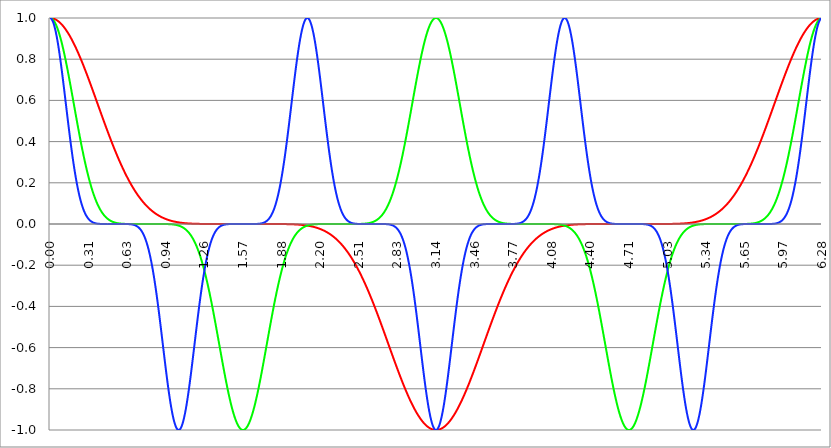
| Category | Series 1 | Series 0 | Series 2 |
|---|---|---|---|
| 0.0 | 1 | 1 | 1 |
| 0.00314159265358979 | 1 | 1 | 1 |
| 0.00628318530717958 | 1 | 0.999 | 0.999 |
| 0.00942477796076938 | 1 | 0.999 | 0.997 |
| 0.0125663706143592 | 0.999 | 0.998 | 0.995 |
| 0.015707963267949 | 0.999 | 0.997 | 0.992 |
| 0.0188495559215388 | 0.999 | 0.995 | 0.989 |
| 0.0219911485751285 | 0.998 | 0.993 | 0.985 |
| 0.0251327412287183 | 0.998 | 0.991 | 0.98 |
| 0.0282743338823081 | 0.997 | 0.989 | 0.975 |
| 0.0314159265358979 | 0.997 | 0.986 | 0.969 |
| 0.0345575191894877 | 0.996 | 0.983 | 0.963 |
| 0.0376991118430775 | 0.995 | 0.98 | 0.956 |
| 0.0408407044966673 | 0.994 | 0.977 | 0.949 |
| 0.0439822971502571 | 0.993 | 0.973 | 0.941 |
| 0.0471238898038469 | 0.992 | 0.969 | 0.932 |
| 0.0502654824574367 | 0.991 | 0.965 | 0.923 |
| 0.0534070751110265 | 0.99 | 0.961 | 0.914 |
| 0.0565486677646163 | 0.989 | 0.956 | 0.904 |
| 0.059690260418206 | 0.988 | 0.951 | 0.893 |
| 0.0628318530717958 | 0.986 | 0.946 | 0.882 |
| 0.0659734457253856 | 0.985 | 0.941 | 0.871 |
| 0.0691150383789754 | 0.983 | 0.935 | 0.859 |
| 0.0722566310325652 | 0.982 | 0.929 | 0.847 |
| 0.075398223686155 | 0.98 | 0.923 | 0.835 |
| 0.0785398163397448 | 0.979 | 0.917 | 0.822 |
| 0.0816814089933346 | 0.977 | 0.91 | 0.809 |
| 0.0848230016469244 | 0.975 | 0.904 | 0.795 |
| 0.0879645943005142 | 0.973 | 0.897 | 0.781 |
| 0.091106186954104 | 0.971 | 0.89 | 0.767 |
| 0.0942477796076937 | 0.969 | 0.882 | 0.753 |
| 0.0973893722612835 | 0.967 | 0.875 | 0.739 |
| 0.100530964914873 | 0.965 | 0.867 | 0.724 |
| 0.103672557568463 | 0.963 | 0.859 | 0.709 |
| 0.106814150222053 | 0.961 | 0.851 | 0.694 |
| 0.109955742875643 | 0.958 | 0.843 | 0.678 |
| 0.113097335529233 | 0.956 | 0.835 | 0.663 |
| 0.116238928182822 | 0.954 | 0.826 | 0.648 |
| 0.119380520836412 | 0.951 | 0.818 | 0.632 |
| 0.122522113490002 | 0.949 | 0.809 | 0.616 |
| 0.125663706143592 | 0.946 | 0.8 | 0.601 |
| 0.128805298797181 | 0.943 | 0.791 | 0.585 |
| 0.131946891450771 | 0.941 | 0.781 | 0.569 |
| 0.135088484104361 | 0.938 | 0.772 | 0.554 |
| 0.138230076757951 | 0.935 | 0.763 | 0.538 |
| 0.141371669411541 | 0.932 | 0.753 | 0.522 |
| 0.14451326206513 | 0.929 | 0.743 | 0.507 |
| 0.14765485471872 | 0.926 | 0.734 | 0.491 |
| 0.15079644737231 | 0.923 | 0.724 | 0.476 |
| 0.1539380400259 | 0.92 | 0.714 | 0.461 |
| 0.15707963267949 | 0.917 | 0.704 | 0.446 |
| 0.160221225333079 | 0.914 | 0.694 | 0.431 |
| 0.163362817986669 | 0.91 | 0.684 | 0.416 |
| 0.166504410640259 | 0.907 | 0.673 | 0.402 |
| 0.169646003293849 | 0.904 | 0.663 | 0.387 |
| 0.172787595947439 | 0.9 | 0.653 | 0.373 |
| 0.175929188601028 | 0.897 | 0.642 | 0.359 |
| 0.179070781254618 | 0.893 | 0.632 | 0.345 |
| 0.182212373908208 | 0.89 | 0.622 | 0.332 |
| 0.185353966561798 | 0.886 | 0.611 | 0.319 |
| 0.188495559215388 | 0.882 | 0.601 | 0.306 |
| 0.191637151868977 | 0.879 | 0.59 | 0.293 |
| 0.194778744522567 | 0.875 | 0.58 | 0.281 |
| 0.197920337176157 | 0.871 | 0.569 | 0.269 |
| 0.201061929829747 | 0.867 | 0.559 | 0.257 |
| 0.204203522483336 | 0.863 | 0.548 | 0.245 |
| 0.207345115136926 | 0.859 | 0.538 | 0.234 |
| 0.210486707790516 | 0.855 | 0.528 | 0.223 |
| 0.213628300444106 | 0.851 | 0.517 | 0.213 |
| 0.216769893097696 | 0.847 | 0.507 | 0.202 |
| 0.219911485751285 | 0.843 | 0.497 | 0.192 |
| 0.223053078404875 | 0.839 | 0.486 | 0.183 |
| 0.226194671058465 | 0.835 | 0.476 | 0.173 |
| 0.229336263712055 | 0.831 | 0.466 | 0.164 |
| 0.232477856365645 | 0.826 | 0.456 | 0.155 |
| 0.235619449019234 | 0.822 | 0.446 | 0.147 |
| 0.238761041672824 | 0.818 | 0.436 | 0.139 |
| 0.241902634326414 | 0.813 | 0.426 | 0.131 |
| 0.245044226980004 | 0.809 | 0.416 | 0.124 |
| 0.248185819633594 | 0.804 | 0.406 | 0.116 |
| 0.251327412287183 | 0.8 | 0.397 | 0.109 |
| 0.254469004940773 | 0.795 | 0.387 | 0.103 |
| 0.257610597594363 | 0.791 | 0.378 | 0.096 |
| 0.260752190247953 | 0.786 | 0.368 | 0.09 |
| 0.263893782901543 | 0.781 | 0.359 | 0.085 |
| 0.267035375555132 | 0.777 | 0.35 | 0.079 |
| 0.270176968208722 | 0.772 | 0.341 | 0.074 |
| 0.273318560862312 | 0.767 | 0.332 | 0.069 |
| 0.276460153515902 | 0.763 | 0.323 | 0.064 |
| 0.279601746169492 | 0.758 | 0.314 | 0.06 |
| 0.282743338823082 | 0.753 | 0.306 | 0.055 |
| 0.285884931476671 | 0.748 | 0.297 | 0.051 |
| 0.289026524130261 | 0.743 | 0.289 | 0.047 |
| 0.292168116783851 | 0.739 | 0.281 | 0.044 |
| 0.295309709437441 | 0.734 | 0.273 | 0.041 |
| 0.298451302091031 | 0.729 | 0.265 | 0.037 |
| 0.30159289474462 | 0.724 | 0.257 | 0.034 |
| 0.30473448739821 | 0.719 | 0.249 | 0.032 |
| 0.3078760800518 | 0.714 | 0.242 | 0.029 |
| 0.31101767270539 | 0.709 | 0.234 | 0.027 |
| 0.31415926535898 | 0.704 | 0.227 | 0.024 |
| 0.31730085801257 | 0.699 | 0.22 | 0.022 |
| 0.320442450666159 | 0.694 | 0.213 | 0.02 |
| 0.323584043319749 | 0.689 | 0.206 | 0.018 |
| 0.326725635973339 | 0.684 | 0.199 | 0.017 |
| 0.329867228626929 | 0.678 | 0.192 | 0.015 |
| 0.333008821280519 | 0.673 | 0.186 | 0.014 |
| 0.336150413934108 | 0.668 | 0.179 | 0.012 |
| 0.339292006587698 | 0.663 | 0.173 | 0.011 |
| 0.342433599241288 | 0.658 | 0.167 | 0.01 |
| 0.345575191894878 | 0.653 | 0.161 | 0.009 |
| 0.348716784548468 | 0.648 | 0.155 | 0.008 |
| 0.351858377202058 | 0.642 | 0.15 | 0.007 |
| 0.354999969855647 | 0.637 | 0.144 | 0.006 |
| 0.358141562509237 | 0.632 | 0.139 | 0.006 |
| 0.361283155162827 | 0.627 | 0.134 | 0.005 |
| 0.364424747816417 | 0.622 | 0.129 | 0.004 |
| 0.367566340470007 | 0.616 | 0.124 | 0.004 |
| 0.370707933123597 | 0.611 | 0.119 | 0.003 |
| 0.373849525777186 | 0.606 | 0.114 | 0.003 |
| 0.376991118430776 | 0.601 | 0.109 | 0.003 |
| 0.380132711084366 | 0.595 | 0.105 | 0.002 |
| 0.383274303737956 | 0.59 | 0.101 | 0.002 |
| 0.386415896391546 | 0.585 | 0.096 | 0.002 |
| 0.389557489045135 | 0.58 | 0.092 | 0.001 |
| 0.392699081698725 | 0.575 | 0.088 | 0.001 |
| 0.395840674352315 | 0.569 | 0.085 | 0.001 |
| 0.398982267005905 | 0.564 | 0.081 | 0.001 |
| 0.402123859659495 | 0.559 | 0.077 | 0.001 |
| 0.405265452313085 | 0.554 | 0.074 | 0.001 |
| 0.408407044966674 | 0.548 | 0.07 | 0.001 |
| 0.411548637620264 | 0.543 | 0.067 | 0 |
| 0.414690230273854 | 0.538 | 0.064 | 0 |
| 0.417831822927444 | 0.533 | 0.061 | 0 |
| 0.420973415581034 | 0.528 | 0.058 | 0 |
| 0.424115008234623 | 0.522 | 0.055 | 0 |
| 0.427256600888213 | 0.517 | 0.053 | 0 |
| 0.430398193541803 | 0.512 | 0.05 | 0 |
| 0.433539786195393 | 0.507 | 0.047 | 0 |
| 0.436681378848983 | 0.502 | 0.045 | 0 |
| 0.439822971502573 | 0.497 | 0.043 | 0 |
| 0.442964564156162 | 0.491 | 0.041 | 0 |
| 0.446106156809752 | 0.486 | 0.038 | 0 |
| 0.449247749463342 | 0.481 | 0.036 | 0 |
| 0.452389342116932 | 0.476 | 0.034 | 0 |
| 0.455530934770522 | 0.471 | 0.032 | 0 |
| 0.458672527424111 | 0.466 | 0.031 | 0 |
| 0.461814120077701 | 0.461 | 0.029 | 0 |
| 0.464955712731291 | 0.456 | 0.027 | 0 |
| 0.468097305384881 | 0.451 | 0.026 | 0 |
| 0.471238898038471 | 0.446 | 0.024 | 0 |
| 0.474380490692061 | 0.441 | 0.023 | 0 |
| 0.47752208334565 | 0.436 | 0.021 | 0 |
| 0.48066367599924 | 0.431 | 0.02 | 0 |
| 0.48380526865283 | 0.426 | 0.019 | 0 |
| 0.48694686130642 | 0.421 | 0.018 | 0 |
| 0.49008845396001 | 0.416 | 0.017 | 0 |
| 0.493230046613599 | 0.411 | 0.016 | 0 |
| 0.496371639267189 | 0.406 | 0.015 | 0 |
| 0.499513231920779 | 0.402 | 0.014 | 0 |
| 0.502654824574369 | 0.397 | 0.013 | 0 |
| 0.505796417227959 | 0.392 | 0.012 | 0 |
| 0.508938009881549 | 0.387 | 0.011 | 0 |
| 0.512079602535138 | 0.383 | 0.01 | 0 |
| 0.515221195188728 | 0.378 | 0.01 | 0 |
| 0.518362787842318 | 0.373 | 0.009 | 0 |
| 0.521504380495908 | 0.368 | 0.008 | 0 |
| 0.524645973149498 | 0.364 | 0.008 | 0 |
| 0.527787565803087 | 0.359 | 0.007 | 0 |
| 0.530929158456677 | 0.355 | 0.007 | 0 |
| 0.534070751110267 | 0.35 | 0.006 | 0 |
| 0.537212343763857 | 0.345 | 0.006 | 0 |
| 0.540353936417447 | 0.341 | 0.005 | 0 |
| 0.543495529071037 | 0.336 | 0.005 | 0 |
| 0.546637121724626 | 0.332 | 0.004 | 0 |
| 0.549778714378216 | 0.328 | 0.004 | 0 |
| 0.552920307031806 | 0.323 | 0.004 | 0 |
| 0.556061899685396 | 0.319 | 0.003 | 0 |
| 0.559203492338986 | 0.314 | 0.003 | 0 |
| 0.562345084992576 | 0.31 | 0.003 | 0 |
| 0.565486677646165 | 0.306 | 0.003 | 0 |
| 0.568628270299755 | 0.302 | 0.002 | 0 |
| 0.571769862953345 | 0.297 | 0.002 | 0 |
| 0.574911455606935 | 0.293 | 0.002 | 0 |
| 0.578053048260525 | 0.289 | 0.002 | 0 |
| 0.581194640914114 | 0.285 | 0.002 | 0 |
| 0.584336233567704 | 0.281 | 0.001 | 0 |
| 0.587477826221294 | 0.277 | 0.001 | 0 |
| 0.590619418874884 | 0.273 | 0.001 | 0 |
| 0.593761011528474 | 0.269 | 0.001 | 0 |
| 0.596902604182064 | 0.265 | 0.001 | 0 |
| 0.600044196835653 | 0.261 | 0.001 | 0 |
| 0.603185789489243 | 0.257 | 0.001 | 0 |
| 0.606327382142833 | 0.253 | 0.001 | 0 |
| 0.609468974796423 | 0.249 | 0.001 | 0 |
| 0.612610567450013 | 0.245 | 0.001 | 0 |
| 0.615752160103602 | 0.242 | 0 | 0 |
| 0.618893752757192 | 0.238 | 0 | 0 |
| 0.622035345410782 | 0.234 | 0 | 0 |
| 0.625176938064372 | 0.23 | 0 | 0 |
| 0.628318530717962 | 0.227 | 0 | 0 |
| 0.631460123371551 | 0.223 | 0 | 0 |
| 0.634601716025141 | 0.22 | 0 | 0 |
| 0.637743308678731 | 0.216 | 0 | 0 |
| 0.640884901332321 | 0.213 | 0 | -0.001 |
| 0.644026493985911 | 0.209 | 0 | -0.001 |
| 0.647168086639501 | 0.206 | 0 | -0.001 |
| 0.65030967929309 | 0.202 | 0 | -0.001 |
| 0.65345127194668 | 0.199 | 0 | -0.001 |
| 0.65659286460027 | 0.196 | 0 | -0.001 |
| 0.65973445725386 | 0.192 | 0 | -0.002 |
| 0.66287604990745 | 0.189 | 0 | -0.002 |
| 0.666017642561039 | 0.186 | 0 | -0.002 |
| 0.669159235214629 | 0.183 | 0 | -0.002 |
| 0.672300827868219 | 0.179 | 0 | -0.003 |
| 0.675442420521809 | 0.176 | 0 | -0.003 |
| 0.678584013175399 | 0.173 | 0 | -0.004 |
| 0.681725605828989 | 0.17 | 0 | -0.004 |
| 0.684867198482578 | 0.167 | 0 | -0.005 |
| 0.688008791136168 | 0.164 | 0 | -0.005 |
| 0.691150383789758 | 0.161 | 0 | -0.006 |
| 0.694291976443348 | 0.158 | 0 | -0.007 |
| 0.697433569096938 | 0.155 | 0 | -0.008 |
| 0.700575161750528 | 0.153 | 0 | -0.009 |
| 0.703716754404117 | 0.15 | 0 | -0.01 |
| 0.706858347057707 | 0.147 | 0 | -0.011 |
| 0.709999939711297 | 0.144 | 0 | -0.012 |
| 0.713141532364887 | 0.142 | 0 | -0.013 |
| 0.716283125018477 | 0.139 | 0 | -0.015 |
| 0.719424717672066 | 0.136 | 0 | -0.016 |
| 0.722566310325656 | 0.134 | 0 | -0.018 |
| 0.725707902979246 | 0.131 | 0 | -0.02 |
| 0.728849495632836 | 0.129 | 0 | -0.021 |
| 0.731991088286426 | 0.126 | 0 | -0.024 |
| 0.735132680940016 | 0.124 | 0 | -0.026 |
| 0.738274273593605 | 0.121 | 0 | -0.028 |
| 0.741415866247195 | 0.119 | 0 | -0.031 |
| 0.744557458900785 | 0.116 | 0 | -0.033 |
| 0.747699051554375 | 0.114 | 0 | -0.036 |
| 0.750840644207965 | 0.112 | 0 | -0.039 |
| 0.753982236861554 | 0.109 | 0 | -0.043 |
| 0.757123829515144 | 0.107 | 0 | -0.046 |
| 0.760265422168734 | 0.105 | 0 | -0.05 |
| 0.763407014822324 | 0.103 | 0 | -0.054 |
| 0.766548607475914 | 0.101 | 0 | -0.058 |
| 0.769690200129504 | 0.098 | 0 | -0.063 |
| 0.772831792783093 | 0.096 | 0 | -0.067 |
| 0.775973385436683 | 0.094 | 0 | -0.072 |
| 0.779114978090273 | 0.092 | 0 | -0.077 |
| 0.782256570743863 | 0.09 | 0 | -0.083 |
| 0.785398163397453 | 0.088 | 0 | -0.088 |
| 0.788539756051042 | 0.086 | 0 | -0.094 |
| 0.791681348704632 | 0.085 | 0 | -0.101 |
| 0.794822941358222 | 0.083 | 0 | -0.107 |
| 0.797964534011812 | 0.081 | 0 | -0.114 |
| 0.801106126665402 | 0.079 | 0 | -0.121 |
| 0.804247719318992 | 0.077 | 0 | -0.129 |
| 0.807389311972581 | 0.076 | 0 | -0.136 |
| 0.810530904626171 | 0.074 | 0 | -0.144 |
| 0.813672497279761 | 0.072 | 0 | -0.153 |
| 0.816814089933351 | 0.07 | 0 | -0.161 |
| 0.819955682586941 | 0.069 | 0 | -0.17 |
| 0.823097275240531 | 0.067 | 0 | -0.179 |
| 0.82623886789412 | 0.066 | 0 | -0.189 |
| 0.82938046054771 | 0.064 | 0 | -0.199 |
| 0.8325220532013 | 0.063 | 0 | -0.209 |
| 0.83566364585489 | 0.061 | 0 | -0.22 |
| 0.83880523850848 | 0.06 | 0 | -0.23 |
| 0.841946831162069 | 0.058 | 0 | -0.242 |
| 0.845088423815659 | 0.057 | 0 | -0.253 |
| 0.848230016469249 | 0.055 | 0 | -0.265 |
| 0.851371609122839 | 0.054 | 0 | -0.277 |
| 0.854513201776429 | 0.053 | 0 | -0.289 |
| 0.857654794430019 | 0.051 | 0 | -0.302 |
| 0.860796387083608 | 0.05 | 0 | -0.314 |
| 0.863937979737198 | 0.049 | 0 | -0.328 |
| 0.867079572390788 | 0.047 | 0 | -0.341 |
| 0.870221165044378 | 0.046 | 0 | -0.355 |
| 0.873362757697968 | 0.045 | 0 | -0.368 |
| 0.876504350351557 | 0.044 | 0 | -0.383 |
| 0.879645943005147 | 0.043 | 0 | -0.397 |
| 0.882787535658737 | 0.042 | 0 | -0.411 |
| 0.885929128312327 | 0.041 | 0 | -0.426 |
| 0.889070720965917 | 0.039 | 0 | -0.441 |
| 0.892212313619507 | 0.038 | 0 | -0.456 |
| 0.895353906273096 | 0.037 | 0 | -0.471 |
| 0.898495498926686 | 0.036 | 0 | -0.486 |
| 0.901637091580276 | 0.035 | 0 | -0.502 |
| 0.904778684233866 | 0.034 | 0 | -0.517 |
| 0.907920276887456 | 0.033 | 0 | -0.533 |
| 0.911061869541045 | 0.032 | 0 | -0.548 |
| 0.914203462194635 | 0.032 | 0 | -0.564 |
| 0.917345054848225 | 0.031 | 0 | -0.58 |
| 0.920486647501815 | 0.03 | 0 | -0.595 |
| 0.923628240155405 | 0.029 | 0 | -0.611 |
| 0.926769832808995 | 0.028 | 0 | -0.627 |
| 0.929911425462584 | 0.027 | 0 | -0.642 |
| 0.933053018116174 | 0.027 | 0 | -0.658 |
| 0.936194610769764 | 0.026 | 0 | -0.673 |
| 0.939336203423354 | 0.025 | 0 | -0.689 |
| 0.942477796076944 | 0.024 | 0 | -0.704 |
| 0.945619388730533 | 0.024 | 0 | -0.719 |
| 0.948760981384123 | 0.023 | 0 | -0.734 |
| 0.951902574037713 | 0.022 | 0 | -0.748 |
| 0.955044166691303 | 0.021 | 0 | -0.763 |
| 0.958185759344893 | 0.021 | -0.001 | -0.777 |
| 0.961327351998483 | 0.02 | -0.001 | -0.791 |
| 0.964468944652072 | 0.02 | -0.001 | -0.804 |
| 0.967610537305662 | 0.019 | -0.001 | -0.818 |
| 0.970752129959252 | 0.018 | -0.001 | -0.831 |
| 0.973893722612842 | 0.018 | -0.001 | -0.843 |
| 0.977035315266432 | 0.017 | -0.001 | -0.855 |
| 0.980176907920022 | 0.017 | -0.001 | -0.867 |
| 0.983318500573611 | 0.016 | -0.001 | -0.879 |
| 0.986460093227201 | 0.016 | -0.001 | -0.89 |
| 0.989601685880791 | 0.015 | -0.002 | -0.9 |
| 0.992743278534381 | 0.015 | -0.002 | -0.91 |
| 0.995884871187971 | 0.014 | -0.002 | -0.92 |
| 0.99902646384156 | 0.014 | -0.002 | -0.929 |
| 1.00216805649515 | 0.013 | -0.002 | -0.938 |
| 1.00530964914874 | 0.013 | -0.003 | -0.946 |
| 1.00845124180233 | 0.012 | -0.003 | -0.954 |
| 1.01159283445592 | 0.012 | -0.003 | -0.961 |
| 1.01473442710951 | 0.011 | -0.003 | -0.967 |
| 1.017876019763099 | 0.011 | -0.004 | -0.973 |
| 1.021017612416689 | 0.011 | -0.004 | -0.979 |
| 1.02415920507028 | 0.01 | -0.004 | -0.983 |
| 1.027300797723869 | 0.01 | -0.005 | -0.988 |
| 1.030442390377459 | 0.01 | -0.005 | -0.991 |
| 1.033583983031048 | 0.009 | -0.006 | -0.994 |
| 1.036725575684638 | 0.009 | -0.006 | -0.997 |
| 1.039867168338228 | 0.009 | -0.007 | -0.998 |
| 1.043008760991818 | 0.008 | -0.007 | -0.999 |
| 1.046150353645408 | 0.008 | -0.008 | -1 |
| 1.049291946298998 | 0.008 | -0.008 | -1 |
| 1.052433538952587 | 0.007 | -0.009 | -0.999 |
| 1.055575131606177 | 0.007 | -0.01 | -0.998 |
| 1.058716724259767 | 0.007 | -0.01 | -0.996 |
| 1.061858316913357 | 0.007 | -0.011 | -0.993 |
| 1.064999909566947 | 0.006 | -0.012 | -0.99 |
| 1.068141502220536 | 0.006 | -0.013 | -0.986 |
| 1.071283094874126 | 0.006 | -0.014 | -0.982 |
| 1.074424687527716 | 0.006 | -0.015 | -0.977 |
| 1.077566280181306 | 0.005 | -0.016 | -0.971 |
| 1.080707872834896 | 0.005 | -0.017 | -0.965 |
| 1.083849465488486 | 0.005 | -0.018 | -0.958 |
| 1.086991058142075 | 0.005 | -0.019 | -0.951 |
| 1.090132650795665 | 0.005 | -0.02 | -0.943 |
| 1.093274243449255 | 0.004 | -0.021 | -0.935 |
| 1.096415836102845 | 0.004 | -0.023 | -0.926 |
| 1.099557428756435 | 0.004 | -0.024 | -0.917 |
| 1.102699021410025 | 0.004 | -0.026 | -0.907 |
| 1.105840614063614 | 0.004 | -0.027 | -0.897 |
| 1.108982206717204 | 0.003 | -0.029 | -0.886 |
| 1.112123799370794 | 0.003 | -0.031 | -0.875 |
| 1.115265392024384 | 0.003 | -0.032 | -0.863 |
| 1.118406984677974 | 0.003 | -0.034 | -0.851 |
| 1.121548577331563 | 0.003 | -0.036 | -0.839 |
| 1.124690169985153 | 0.003 | -0.038 | -0.826 |
| 1.127831762638743 | 0.003 | -0.041 | -0.813 |
| 1.130973355292333 | 0.003 | -0.043 | -0.8 |
| 1.134114947945923 | 0.002 | -0.045 | -0.786 |
| 1.137256540599513 | 0.002 | -0.047 | -0.772 |
| 1.140398133253102 | 0.002 | -0.05 | -0.758 |
| 1.143539725906692 | 0.002 | -0.053 | -0.743 |
| 1.146681318560282 | 0.002 | -0.055 | -0.729 |
| 1.149822911213872 | 0.002 | -0.058 | -0.714 |
| 1.152964503867462 | 0.002 | -0.061 | -0.699 |
| 1.156106096521051 | 0.002 | -0.064 | -0.684 |
| 1.159247689174641 | 0.002 | -0.067 | -0.668 |
| 1.162389281828231 | 0.002 | -0.07 | -0.653 |
| 1.165530874481821 | 0.001 | -0.074 | -0.637 |
| 1.168672467135411 | 0.001 | -0.077 | -0.622 |
| 1.171814059789001 | 0.001 | -0.081 | -0.606 |
| 1.17495565244259 | 0.001 | -0.085 | -0.59 |
| 1.17809724509618 | 0.001 | -0.088 | -0.575 |
| 1.18123883774977 | 0.001 | -0.092 | -0.559 |
| 1.18438043040336 | 0.001 | -0.096 | -0.543 |
| 1.18752202305695 | 0.001 | -0.101 | -0.528 |
| 1.190663615710539 | 0.001 | -0.105 | -0.512 |
| 1.193805208364129 | 0.001 | -0.109 | -0.497 |
| 1.19694680101772 | 0.001 | -0.114 | -0.481 |
| 1.200088393671309 | 0.001 | -0.119 | -0.466 |
| 1.203229986324899 | 0.001 | -0.124 | -0.451 |
| 1.206371578978489 | 0.001 | -0.129 | -0.436 |
| 1.209513171632078 | 0.001 | -0.134 | -0.421 |
| 1.212654764285668 | 0.001 | -0.139 | -0.406 |
| 1.215796356939258 | 0.001 | -0.144 | -0.392 |
| 1.218937949592848 | 0.001 | -0.15 | -0.378 |
| 1.222079542246438 | 0.001 | -0.155 | -0.364 |
| 1.225221134900027 | 0.001 | -0.161 | -0.35 |
| 1.228362727553617 | 0 | -0.167 | -0.336 |
| 1.231504320207207 | 0 | -0.173 | -0.323 |
| 1.234645912860797 | 0 | -0.179 | -0.31 |
| 1.237787505514387 | 0 | -0.186 | -0.297 |
| 1.240929098167977 | 0 | -0.192 | -0.285 |
| 1.244070690821566 | 0 | -0.199 | -0.273 |
| 1.247212283475156 | 0 | -0.206 | -0.261 |
| 1.250353876128746 | 0 | -0.213 | -0.249 |
| 1.253495468782336 | 0 | -0.22 | -0.238 |
| 1.256637061435926 | 0 | -0.227 | -0.227 |
| 1.259778654089515 | 0 | -0.234 | -0.216 |
| 1.262920246743105 | 0 | -0.242 | -0.206 |
| 1.266061839396695 | 0 | -0.249 | -0.196 |
| 1.269203432050285 | 0 | -0.257 | -0.186 |
| 1.272345024703875 | 0 | -0.265 | -0.176 |
| 1.275486617357465 | 0 | -0.273 | -0.167 |
| 1.278628210011054 | 0 | -0.281 | -0.158 |
| 1.281769802664644 | 0 | -0.289 | -0.15 |
| 1.284911395318234 | 0 | -0.297 | -0.142 |
| 1.288052987971824 | 0 | -0.306 | -0.134 |
| 1.291194580625414 | 0 | -0.314 | -0.126 |
| 1.294336173279003 | 0 | -0.323 | -0.119 |
| 1.297477765932593 | 0 | -0.332 | -0.112 |
| 1.300619358586183 | 0 | -0.341 | -0.105 |
| 1.303760951239773 | 0 | -0.35 | -0.098 |
| 1.306902543893363 | 0 | -0.359 | -0.092 |
| 1.310044136546953 | 0 | -0.368 | -0.086 |
| 1.313185729200542 | 0 | -0.378 | -0.081 |
| 1.316327321854132 | 0 | -0.387 | -0.076 |
| 1.319468914507722 | 0 | -0.397 | -0.07 |
| 1.322610507161312 | 0 | -0.406 | -0.066 |
| 1.325752099814902 | 0 | -0.416 | -0.061 |
| 1.328893692468491 | 0 | -0.426 | -0.057 |
| 1.332035285122081 | 0 | -0.436 | -0.053 |
| 1.335176877775671 | 0 | -0.446 | -0.049 |
| 1.338318470429261 | 0 | -0.456 | -0.045 |
| 1.341460063082851 | 0 | -0.466 | -0.042 |
| 1.344601655736441 | 0 | -0.476 | -0.038 |
| 1.34774324839003 | 0 | -0.486 | -0.035 |
| 1.35088484104362 | 0 | -0.497 | -0.032 |
| 1.35402643369721 | 0 | -0.507 | -0.03 |
| 1.3571680263508 | 0 | -0.517 | -0.027 |
| 1.36030961900439 | 0 | -0.528 | -0.025 |
| 1.363451211657979 | 0 | -0.538 | -0.023 |
| 1.36659280431157 | 0 | -0.548 | -0.021 |
| 1.369734396965159 | 0 | -0.559 | -0.019 |
| 1.372875989618749 | 0 | -0.569 | -0.017 |
| 1.376017582272339 | 0 | -0.58 | -0.016 |
| 1.379159174925929 | 0 | -0.59 | -0.014 |
| 1.382300767579518 | 0 | -0.601 | -0.013 |
| 1.385442360233108 | 0 | -0.611 | -0.011 |
| 1.388583952886698 | 0 | -0.622 | -0.01 |
| 1.391725545540288 | 0 | -0.632 | -0.009 |
| 1.394867138193878 | 0 | -0.642 | -0.008 |
| 1.398008730847468 | 0 | -0.653 | -0.007 |
| 1.401150323501057 | 0 | -0.663 | -0.007 |
| 1.404291916154647 | 0 | -0.673 | -0.006 |
| 1.407433508808237 | 0 | -0.684 | -0.005 |
| 1.410575101461827 | 0 | -0.694 | -0.005 |
| 1.413716694115417 | 0 | -0.704 | -0.004 |
| 1.416858286769006 | 0 | -0.714 | -0.003 |
| 1.419999879422596 | 0 | -0.724 | -0.003 |
| 1.423141472076186 | 0 | -0.734 | -0.003 |
| 1.426283064729776 | 0 | -0.743 | -0.002 |
| 1.429424657383366 | 0 | -0.753 | -0.002 |
| 1.432566250036956 | 0 | -0.763 | -0.002 |
| 1.435707842690545 | 0 | -0.772 | -0.001 |
| 1.438849435344135 | 0 | -0.781 | -0.001 |
| 1.441991027997725 | 0 | -0.791 | -0.001 |
| 1.445132620651315 | 0 | -0.8 | -0.001 |
| 1.448274213304905 | 0 | -0.809 | -0.001 |
| 1.451415805958494 | 0 | -0.818 | -0.001 |
| 1.454557398612084 | 0 | -0.826 | -0.001 |
| 1.457698991265674 | 0 | -0.835 | 0 |
| 1.460840583919264 | 0 | -0.843 | 0 |
| 1.463982176572854 | 0 | -0.851 | 0 |
| 1.467123769226444 | 0 | -0.859 | 0 |
| 1.470265361880033 | 0 | -0.867 | 0 |
| 1.473406954533623 | 0 | -0.875 | 0 |
| 1.476548547187213 | 0 | -0.882 | 0 |
| 1.479690139840803 | 0 | -0.89 | 0 |
| 1.482831732494393 | 0 | -0.897 | 0 |
| 1.485973325147982 | 0 | -0.904 | 0 |
| 1.489114917801572 | 0 | -0.91 | 0 |
| 1.492256510455162 | 0 | -0.917 | 0 |
| 1.495398103108752 | 0 | -0.923 | 0 |
| 1.498539695762342 | 0 | -0.929 | 0 |
| 1.501681288415932 | 0 | -0.935 | 0 |
| 1.504822881069521 | 0 | -0.941 | 0 |
| 1.507964473723111 | 0 | -0.946 | 0 |
| 1.511106066376701 | 0 | -0.951 | 0 |
| 1.514247659030291 | 0 | -0.956 | 0 |
| 1.517389251683881 | 0 | -0.961 | 0 |
| 1.520530844337471 | 0 | -0.965 | 0 |
| 1.52367243699106 | 0 | -0.969 | 0 |
| 1.52681402964465 | 0 | -0.973 | 0 |
| 1.52995562229824 | 0 | -0.977 | 0 |
| 1.53309721495183 | 0 | -0.98 | 0 |
| 1.53623880760542 | 0 | -0.983 | 0 |
| 1.539380400259009 | 0 | -0.986 | 0 |
| 1.542521992912599 | 0 | -0.989 | 0 |
| 1.545663585566189 | 0 | -0.991 | 0 |
| 1.548805178219779 | 0 | -0.993 | 0 |
| 1.551946770873369 | 0 | -0.995 | 0 |
| 1.555088363526959 | 0 | -0.997 | 0 |
| 1.558229956180548 | 0 | -0.998 | 0 |
| 1.561371548834138 | 0 | -0.999 | 0 |
| 1.564513141487728 | 0 | -0.999 | 0 |
| 1.567654734141318 | 0 | -1 | 0 |
| 1.570796326794908 | 0 | -1 | 0 |
| 1.573937919448497 | 0 | -1 | 0 |
| 1.577079512102087 | 0 | -0.999 | 0 |
| 1.580221104755677 | 0 | -0.999 | 0 |
| 1.583362697409267 | 0 | -0.998 | 0 |
| 1.586504290062857 | 0 | -0.997 | 0 |
| 1.589645882716447 | 0 | -0.995 | 0 |
| 1.592787475370036 | 0 | -0.993 | 0 |
| 1.595929068023626 | 0 | -0.991 | 0 |
| 1.599070660677216 | 0 | -0.989 | 0 |
| 1.602212253330806 | 0 | -0.986 | 0 |
| 1.605353845984396 | 0 | -0.983 | 0 |
| 1.608495438637985 | 0 | -0.98 | 0 |
| 1.611637031291575 | 0 | -0.977 | 0 |
| 1.614778623945165 | 0 | -0.973 | 0 |
| 1.617920216598755 | 0 | -0.969 | 0 |
| 1.621061809252345 | 0 | -0.965 | 0 |
| 1.624203401905935 | 0 | -0.961 | 0 |
| 1.627344994559524 | 0 | -0.956 | 0 |
| 1.630486587213114 | 0 | -0.951 | 0 |
| 1.633628179866704 | 0 | -0.946 | 0 |
| 1.636769772520294 | 0 | -0.941 | 0 |
| 1.639911365173884 | 0 | -0.935 | 0 |
| 1.643052957827473 | 0 | -0.929 | 0 |
| 1.646194550481063 | 0 | -0.923 | 0 |
| 1.649336143134653 | 0 | -0.917 | 0 |
| 1.652477735788243 | 0 | -0.91 | 0 |
| 1.655619328441833 | 0 | -0.904 | 0 |
| 1.658760921095423 | 0 | -0.897 | 0 |
| 1.661902513749012 | 0 | -0.89 | 0 |
| 1.665044106402602 | 0 | -0.882 | 0 |
| 1.668185699056192 | 0 | -0.875 | 0 |
| 1.671327291709782 | 0 | -0.867 | 0 |
| 1.674468884363372 | 0 | -0.859 | 0 |
| 1.677610477016961 | 0 | -0.851 | 0 |
| 1.680752069670551 | 0 | -0.843 | 0 |
| 1.683893662324141 | 0 | -0.835 | 0 |
| 1.687035254977731 | 0 | -0.826 | 0.001 |
| 1.690176847631321 | 0 | -0.818 | 0.001 |
| 1.693318440284911 | 0 | -0.809 | 0.001 |
| 1.6964600329385 | 0 | -0.8 | 0.001 |
| 1.69960162559209 | 0 | -0.791 | 0.001 |
| 1.70274321824568 | 0 | -0.781 | 0.001 |
| 1.70588481089927 | 0 | -0.772 | 0.001 |
| 1.70902640355286 | 0 | -0.763 | 0.002 |
| 1.712167996206449 | 0 | -0.753 | 0.002 |
| 1.715309588860039 | 0 | -0.743 | 0.002 |
| 1.71845118151363 | 0 | -0.734 | 0.003 |
| 1.721592774167219 | 0 | -0.724 | 0.003 |
| 1.724734366820809 | 0 | -0.714 | 0.003 |
| 1.727875959474399 | 0 | -0.704 | 0.004 |
| 1.731017552127988 | 0 | -0.694 | 0.005 |
| 1.734159144781578 | 0 | -0.684 | 0.005 |
| 1.737300737435168 | 0 | -0.673 | 0.006 |
| 1.740442330088758 | 0 | -0.663 | 0.007 |
| 1.743583922742348 | 0 | -0.653 | 0.007 |
| 1.746725515395937 | 0 | -0.642 | 0.008 |
| 1.749867108049527 | 0 | -0.632 | 0.009 |
| 1.753008700703117 | 0 | -0.622 | 0.01 |
| 1.756150293356707 | 0 | -0.611 | 0.011 |
| 1.759291886010297 | 0 | -0.601 | 0.013 |
| 1.762433478663887 | 0 | -0.59 | 0.014 |
| 1.765575071317476 | 0 | -0.58 | 0.016 |
| 1.768716663971066 | 0 | -0.569 | 0.017 |
| 1.771858256624656 | 0 | -0.559 | 0.019 |
| 1.774999849278246 | 0 | -0.548 | 0.021 |
| 1.778141441931836 | 0 | -0.538 | 0.023 |
| 1.781283034585426 | 0 | -0.528 | 0.025 |
| 1.784424627239015 | 0 | -0.517 | 0.027 |
| 1.787566219892605 | 0 | -0.507 | 0.03 |
| 1.790707812546195 | 0 | -0.497 | 0.032 |
| 1.793849405199785 | 0 | -0.486 | 0.035 |
| 1.796990997853375 | 0 | -0.476 | 0.038 |
| 1.800132590506964 | 0 | -0.466 | 0.042 |
| 1.803274183160554 | 0 | -0.456 | 0.045 |
| 1.806415775814144 | 0 | -0.446 | 0.049 |
| 1.809557368467734 | 0 | -0.436 | 0.053 |
| 1.812698961121324 | 0 | -0.426 | 0.057 |
| 1.815840553774914 | 0 | -0.416 | 0.061 |
| 1.818982146428503 | 0 | -0.406 | 0.066 |
| 1.822123739082093 | 0 | -0.397 | 0.07 |
| 1.825265331735683 | 0 | -0.387 | 0.076 |
| 1.828406924389273 | 0 | -0.378 | 0.081 |
| 1.831548517042863 | 0 | -0.368 | 0.086 |
| 1.834690109696452 | 0 | -0.359 | 0.092 |
| 1.837831702350042 | 0 | -0.35 | 0.098 |
| 1.840973295003632 | 0 | -0.341 | 0.105 |
| 1.844114887657222 | 0 | -0.332 | 0.112 |
| 1.847256480310812 | 0 | -0.323 | 0.119 |
| 1.850398072964402 | 0 | -0.314 | 0.126 |
| 1.853539665617991 | 0 | -0.306 | 0.134 |
| 1.856681258271581 | 0 | -0.297 | 0.142 |
| 1.859822850925171 | 0 | -0.289 | 0.15 |
| 1.862964443578761 | 0 | -0.281 | 0.158 |
| 1.866106036232351 | 0 | -0.273 | 0.167 |
| 1.86924762888594 | 0 | -0.265 | 0.176 |
| 1.87238922153953 | 0 | -0.257 | 0.186 |
| 1.87553081419312 | 0 | -0.249 | 0.196 |
| 1.87867240684671 | 0 | -0.242 | 0.206 |
| 1.8818139995003 | 0 | -0.234 | 0.216 |
| 1.88495559215389 | 0 | -0.227 | 0.227 |
| 1.888097184807479 | 0 | -0.22 | 0.238 |
| 1.891238777461069 | 0 | -0.213 | 0.249 |
| 1.89438037011466 | 0 | -0.206 | 0.261 |
| 1.897521962768249 | 0 | -0.199 | 0.273 |
| 1.900663555421839 | 0 | -0.192 | 0.285 |
| 1.903805148075429 | 0 | -0.186 | 0.297 |
| 1.906946740729018 | 0 | -0.179 | 0.31 |
| 1.910088333382608 | 0 | -0.173 | 0.323 |
| 1.913229926036198 | 0 | -0.167 | 0.336 |
| 1.916371518689788 | -0.001 | -0.161 | 0.35 |
| 1.919513111343378 | -0.001 | -0.155 | 0.364 |
| 1.922654703996967 | -0.001 | -0.15 | 0.378 |
| 1.925796296650557 | -0.001 | -0.144 | 0.392 |
| 1.928937889304147 | -0.001 | -0.139 | 0.406 |
| 1.932079481957737 | -0.001 | -0.134 | 0.421 |
| 1.935221074611327 | -0.001 | -0.129 | 0.436 |
| 1.938362667264917 | -0.001 | -0.124 | 0.451 |
| 1.941504259918506 | -0.001 | -0.119 | 0.466 |
| 1.944645852572096 | -0.001 | -0.114 | 0.481 |
| 1.947787445225686 | -0.001 | -0.109 | 0.497 |
| 1.950929037879276 | -0.001 | -0.105 | 0.512 |
| 1.954070630532866 | -0.001 | -0.101 | 0.528 |
| 1.957212223186455 | -0.001 | -0.096 | 0.543 |
| 1.960353815840045 | -0.001 | -0.092 | 0.559 |
| 1.963495408493635 | -0.001 | -0.088 | 0.575 |
| 1.966637001147225 | -0.001 | -0.085 | 0.59 |
| 1.969778593800815 | -0.001 | -0.081 | 0.606 |
| 1.972920186454405 | -0.001 | -0.077 | 0.622 |
| 1.976061779107994 | -0.001 | -0.074 | 0.637 |
| 1.979203371761584 | -0.002 | -0.07 | 0.653 |
| 1.982344964415174 | -0.002 | -0.067 | 0.668 |
| 1.985486557068764 | -0.002 | -0.064 | 0.684 |
| 1.988628149722354 | -0.002 | -0.061 | 0.699 |
| 1.991769742375943 | -0.002 | -0.058 | 0.714 |
| 1.994911335029533 | -0.002 | -0.055 | 0.729 |
| 1.998052927683123 | -0.002 | -0.053 | 0.743 |
| 2.001194520336712 | -0.002 | -0.05 | 0.758 |
| 2.004336112990302 | -0.002 | -0.047 | 0.772 |
| 2.007477705643892 | -0.002 | -0.045 | 0.786 |
| 2.010619298297482 | -0.003 | -0.043 | 0.8 |
| 2.013760890951071 | -0.003 | -0.041 | 0.813 |
| 2.016902483604661 | -0.003 | -0.038 | 0.826 |
| 2.02004407625825 | -0.003 | -0.036 | 0.839 |
| 2.02318566891184 | -0.003 | -0.034 | 0.851 |
| 2.02632726156543 | -0.003 | -0.032 | 0.863 |
| 2.029468854219019 | -0.003 | -0.031 | 0.875 |
| 2.032610446872609 | -0.003 | -0.029 | 0.886 |
| 2.035752039526198 | -0.004 | -0.027 | 0.897 |
| 2.038893632179788 | -0.004 | -0.026 | 0.907 |
| 2.042035224833378 | -0.004 | -0.024 | 0.917 |
| 2.045176817486967 | -0.004 | -0.023 | 0.926 |
| 2.048318410140557 | -0.004 | -0.021 | 0.935 |
| 2.051460002794146 | -0.005 | -0.02 | 0.943 |
| 2.054601595447736 | -0.005 | -0.019 | 0.951 |
| 2.057743188101325 | -0.005 | -0.018 | 0.958 |
| 2.060884780754915 | -0.005 | -0.017 | 0.965 |
| 2.064026373408505 | -0.005 | -0.016 | 0.971 |
| 2.067167966062094 | -0.006 | -0.015 | 0.977 |
| 2.070309558715684 | -0.006 | -0.014 | 0.982 |
| 2.073451151369273 | -0.006 | -0.013 | 0.986 |
| 2.076592744022863 | -0.006 | -0.012 | 0.99 |
| 2.079734336676452 | -0.007 | -0.011 | 0.993 |
| 2.082875929330042 | -0.007 | -0.01 | 0.996 |
| 2.086017521983632 | -0.007 | -0.01 | 0.998 |
| 2.089159114637221 | -0.007 | -0.009 | 0.999 |
| 2.092300707290811 | -0.008 | -0.008 | 1 |
| 2.095442299944401 | -0.008 | -0.008 | 1 |
| 2.09858389259799 | -0.008 | -0.007 | 0.999 |
| 2.10172548525158 | -0.009 | -0.007 | 0.998 |
| 2.104867077905169 | -0.009 | -0.006 | 0.997 |
| 2.108008670558759 | -0.009 | -0.006 | 0.994 |
| 2.111150263212349 | -0.01 | -0.005 | 0.991 |
| 2.114291855865938 | -0.01 | -0.005 | 0.988 |
| 2.117433448519528 | -0.01 | -0.004 | 0.983 |
| 2.120575041173117 | -0.011 | -0.004 | 0.979 |
| 2.123716633826707 | -0.011 | -0.004 | 0.973 |
| 2.126858226480297 | -0.011 | -0.003 | 0.967 |
| 2.129999819133886 | -0.012 | -0.003 | 0.961 |
| 2.133141411787476 | -0.012 | -0.003 | 0.954 |
| 2.136283004441065 | -0.013 | -0.003 | 0.946 |
| 2.139424597094655 | -0.013 | -0.002 | 0.938 |
| 2.142566189748245 | -0.014 | -0.002 | 0.929 |
| 2.145707782401834 | -0.014 | -0.002 | 0.92 |
| 2.148849375055424 | -0.015 | -0.002 | 0.91 |
| 2.151990967709013 | -0.015 | -0.002 | 0.9 |
| 2.155132560362603 | -0.016 | -0.001 | 0.89 |
| 2.158274153016193 | -0.016 | -0.001 | 0.879 |
| 2.161415745669782 | -0.017 | -0.001 | 0.867 |
| 2.164557338323372 | -0.017 | -0.001 | 0.855 |
| 2.167698930976961 | -0.018 | -0.001 | 0.843 |
| 2.170840523630551 | -0.018 | -0.001 | 0.831 |
| 2.173982116284141 | -0.019 | -0.001 | 0.818 |
| 2.17712370893773 | -0.02 | -0.001 | 0.804 |
| 2.18026530159132 | -0.02 | -0.001 | 0.791 |
| 2.183406894244909 | -0.021 | -0.001 | 0.777 |
| 2.186548486898499 | -0.021 | 0 | 0.763 |
| 2.189690079552089 | -0.022 | 0 | 0.748 |
| 2.192831672205678 | -0.023 | 0 | 0.734 |
| 2.195973264859268 | -0.024 | 0 | 0.719 |
| 2.199114857512857 | -0.024 | 0 | 0.704 |
| 2.202256450166447 | -0.025 | 0 | 0.689 |
| 2.205398042820036 | -0.026 | 0 | 0.673 |
| 2.208539635473626 | -0.027 | 0 | 0.658 |
| 2.211681228127216 | -0.027 | 0 | 0.642 |
| 2.214822820780805 | -0.028 | 0 | 0.627 |
| 2.217964413434395 | -0.029 | 0 | 0.611 |
| 2.221106006087984 | -0.03 | 0 | 0.595 |
| 2.224247598741574 | -0.031 | 0 | 0.58 |
| 2.227389191395164 | -0.032 | 0 | 0.564 |
| 2.230530784048753 | -0.032 | 0 | 0.548 |
| 2.233672376702343 | -0.033 | 0 | 0.533 |
| 2.236813969355933 | -0.034 | 0 | 0.517 |
| 2.239955562009522 | -0.035 | 0 | 0.502 |
| 2.243097154663112 | -0.036 | 0 | 0.486 |
| 2.246238747316701 | -0.037 | 0 | 0.471 |
| 2.249380339970291 | -0.038 | 0 | 0.456 |
| 2.252521932623881 | -0.039 | 0 | 0.441 |
| 2.25566352527747 | -0.041 | 0 | 0.426 |
| 2.25880511793106 | -0.042 | 0 | 0.411 |
| 2.261946710584649 | -0.043 | 0 | 0.397 |
| 2.265088303238239 | -0.044 | 0 | 0.383 |
| 2.268229895891829 | -0.045 | 0 | 0.368 |
| 2.271371488545418 | -0.046 | 0 | 0.355 |
| 2.274513081199008 | -0.047 | 0 | 0.341 |
| 2.277654673852597 | -0.049 | 0 | 0.328 |
| 2.280796266506186 | -0.05 | 0 | 0.314 |
| 2.283937859159776 | -0.051 | 0 | 0.302 |
| 2.287079451813366 | -0.053 | 0 | 0.289 |
| 2.290221044466955 | -0.054 | 0 | 0.277 |
| 2.293362637120545 | -0.055 | 0 | 0.265 |
| 2.296504229774135 | -0.057 | 0 | 0.253 |
| 2.299645822427724 | -0.058 | 0 | 0.242 |
| 2.302787415081314 | -0.06 | 0 | 0.23 |
| 2.305929007734904 | -0.061 | 0 | 0.22 |
| 2.309070600388493 | -0.063 | 0 | 0.209 |
| 2.312212193042083 | -0.064 | 0 | 0.199 |
| 2.315353785695672 | -0.066 | 0 | 0.189 |
| 2.318495378349262 | -0.067 | 0 | 0.179 |
| 2.321636971002852 | -0.069 | 0 | 0.17 |
| 2.324778563656441 | -0.07 | 0 | 0.161 |
| 2.327920156310031 | -0.072 | 0 | 0.153 |
| 2.33106174896362 | -0.074 | 0 | 0.144 |
| 2.33420334161721 | -0.076 | 0 | 0.136 |
| 2.3373449342708 | -0.077 | 0 | 0.129 |
| 2.340486526924389 | -0.079 | 0 | 0.121 |
| 2.343628119577979 | -0.081 | 0 | 0.114 |
| 2.346769712231568 | -0.083 | 0 | 0.107 |
| 2.349911304885158 | -0.085 | 0 | 0.101 |
| 2.353052897538748 | -0.086 | 0 | 0.094 |
| 2.356194490192337 | -0.088 | 0 | 0.088 |
| 2.359336082845927 | -0.09 | 0 | 0.083 |
| 2.362477675499516 | -0.092 | 0 | 0.077 |
| 2.365619268153106 | -0.094 | 0 | 0.072 |
| 2.368760860806696 | -0.096 | 0 | 0.067 |
| 2.371902453460285 | -0.098 | 0 | 0.063 |
| 2.375044046113875 | -0.101 | 0 | 0.058 |
| 2.378185638767464 | -0.103 | 0 | 0.054 |
| 2.381327231421054 | -0.105 | 0 | 0.05 |
| 2.384468824074644 | -0.107 | 0 | 0.046 |
| 2.387610416728233 | -0.109 | 0 | 0.043 |
| 2.390752009381823 | -0.112 | 0 | 0.039 |
| 2.393893602035412 | -0.114 | 0 | 0.036 |
| 2.397035194689002 | -0.116 | 0 | 0.033 |
| 2.400176787342591 | -0.119 | 0 | 0.031 |
| 2.403318379996181 | -0.121 | 0 | 0.028 |
| 2.406459972649771 | -0.124 | 0 | 0.026 |
| 2.40960156530336 | -0.126 | 0 | 0.024 |
| 2.41274315795695 | -0.129 | 0 | 0.021 |
| 2.41588475061054 | -0.131 | 0 | 0.02 |
| 2.419026343264129 | -0.134 | 0 | 0.018 |
| 2.422167935917719 | -0.136 | 0 | 0.016 |
| 2.425309528571308 | -0.139 | 0 | 0.015 |
| 2.428451121224898 | -0.142 | 0 | 0.013 |
| 2.431592713878488 | -0.144 | 0 | 0.012 |
| 2.434734306532077 | -0.147 | 0 | 0.011 |
| 2.437875899185667 | -0.15 | 0 | 0.01 |
| 2.441017491839256 | -0.153 | 0 | 0.009 |
| 2.444159084492846 | -0.155 | 0 | 0.008 |
| 2.447300677146435 | -0.158 | 0 | 0.007 |
| 2.450442269800025 | -0.161 | 0 | 0.006 |
| 2.453583862453615 | -0.164 | 0 | 0.005 |
| 2.456725455107204 | -0.167 | 0 | 0.005 |
| 2.459867047760794 | -0.17 | 0 | 0.004 |
| 2.463008640414384 | -0.173 | 0 | 0.004 |
| 2.466150233067973 | -0.176 | 0 | 0.003 |
| 2.469291825721563 | -0.179 | 0 | 0.003 |
| 2.472433418375152 | -0.183 | 0 | 0.002 |
| 2.475575011028742 | -0.186 | 0 | 0.002 |
| 2.478716603682332 | -0.189 | 0 | 0.002 |
| 2.481858196335921 | -0.192 | 0 | 0.002 |
| 2.48499978898951 | -0.196 | 0 | 0.001 |
| 2.4881413816431 | -0.199 | 0 | 0.001 |
| 2.49128297429669 | -0.202 | 0 | 0.001 |
| 2.49442456695028 | -0.206 | 0 | 0.001 |
| 2.497566159603869 | -0.209 | 0 | 0.001 |
| 2.500707752257458 | -0.213 | 0 | 0.001 |
| 2.503849344911048 | -0.216 | 0 | 0 |
| 2.506990937564638 | -0.22 | 0 | 0 |
| 2.510132530218228 | -0.223 | 0 | 0 |
| 2.513274122871817 | -0.227 | 0 | 0 |
| 2.516415715525407 | -0.23 | 0 | 0 |
| 2.519557308178996 | -0.234 | 0 | 0 |
| 2.522698900832586 | -0.238 | 0 | 0 |
| 2.525840493486176 | -0.242 | 0 | 0 |
| 2.528982086139765 | -0.245 | 0.001 | 0 |
| 2.532123678793355 | -0.249 | 0.001 | 0 |
| 2.535265271446944 | -0.253 | 0.001 | 0 |
| 2.538406864100534 | -0.257 | 0.001 | 0 |
| 2.541548456754124 | -0.261 | 0.001 | 0 |
| 2.544690049407713 | -0.265 | 0.001 | 0 |
| 2.547831642061302 | -0.269 | 0.001 | 0 |
| 2.550973234714892 | -0.273 | 0.001 | 0 |
| 2.554114827368482 | -0.277 | 0.001 | 0 |
| 2.557256420022072 | -0.281 | 0.001 | 0 |
| 2.560398012675661 | -0.285 | 0.002 | 0 |
| 2.563539605329251 | -0.289 | 0.002 | 0 |
| 2.56668119798284 | -0.293 | 0.002 | 0 |
| 2.56982279063643 | -0.297 | 0.002 | 0 |
| 2.57296438329002 | -0.302 | 0.002 | 0 |
| 2.576105975943609 | -0.306 | 0.003 | 0 |
| 2.579247568597199 | -0.31 | 0.003 | 0 |
| 2.582389161250788 | -0.314 | 0.003 | 0 |
| 2.585530753904377 | -0.319 | 0.003 | 0 |
| 2.588672346557967 | -0.323 | 0.004 | 0 |
| 2.591813939211557 | -0.328 | 0.004 | 0 |
| 2.594955531865147 | -0.332 | 0.004 | 0 |
| 2.598097124518736 | -0.336 | 0.005 | 0 |
| 2.601238717172326 | -0.341 | 0.005 | 0 |
| 2.604380309825915 | -0.345 | 0.006 | 0 |
| 2.607521902479505 | -0.35 | 0.006 | 0 |
| 2.610663495133095 | -0.355 | 0.007 | 0 |
| 2.613805087786684 | -0.359 | 0.007 | 0 |
| 2.616946680440274 | -0.364 | 0.008 | 0 |
| 2.620088273093863 | -0.368 | 0.008 | 0 |
| 2.623229865747452 | -0.373 | 0.009 | 0 |
| 2.626371458401042 | -0.378 | 0.01 | 0 |
| 2.629513051054632 | -0.383 | 0.01 | 0 |
| 2.632654643708222 | -0.387 | 0.011 | 0 |
| 2.635796236361811 | -0.392 | 0.012 | 0 |
| 2.638937829015401 | -0.397 | 0.013 | 0 |
| 2.642079421668991 | -0.402 | 0.014 | 0 |
| 2.64522101432258 | -0.406 | 0.015 | 0 |
| 2.64836260697617 | -0.411 | 0.016 | 0 |
| 2.651504199629759 | -0.416 | 0.017 | 0 |
| 2.654645792283349 | -0.421 | 0.018 | 0 |
| 2.657787384936938 | -0.426 | 0.019 | 0 |
| 2.660928977590528 | -0.431 | 0.02 | 0 |
| 2.664070570244118 | -0.436 | 0.021 | 0 |
| 2.667212162897707 | -0.441 | 0.023 | 0 |
| 2.670353755551297 | -0.446 | 0.024 | 0 |
| 2.673495348204887 | -0.451 | 0.026 | 0 |
| 2.676636940858476 | -0.456 | 0.027 | 0 |
| 2.679778533512066 | -0.461 | 0.029 | 0 |
| 2.682920126165655 | -0.466 | 0.031 | 0 |
| 2.686061718819245 | -0.471 | 0.032 | 0 |
| 2.689203311472835 | -0.476 | 0.034 | 0 |
| 2.692344904126424 | -0.481 | 0.036 | 0 |
| 2.695486496780014 | -0.486 | 0.038 | 0 |
| 2.698628089433603 | -0.491 | 0.041 | 0 |
| 2.701769682087193 | -0.497 | 0.043 | 0 |
| 2.704911274740782 | -0.502 | 0.045 | 0 |
| 2.708052867394372 | -0.507 | 0.047 | 0 |
| 2.711194460047962 | -0.512 | 0.05 | 0 |
| 2.714336052701551 | -0.517 | 0.053 | 0 |
| 2.717477645355141 | -0.522 | 0.055 | 0 |
| 2.720619238008731 | -0.528 | 0.058 | 0 |
| 2.72376083066232 | -0.533 | 0.061 | 0 |
| 2.72690242331591 | -0.538 | 0.064 | 0 |
| 2.730044015969499 | -0.543 | 0.067 | 0 |
| 2.733185608623089 | -0.548 | 0.07 | -0.001 |
| 2.736327201276678 | -0.554 | 0.074 | -0.001 |
| 2.739468793930268 | -0.559 | 0.077 | -0.001 |
| 2.742610386583858 | -0.564 | 0.081 | -0.001 |
| 2.745751979237447 | -0.569 | 0.085 | -0.001 |
| 2.748893571891036 | -0.575 | 0.088 | -0.001 |
| 2.752035164544627 | -0.58 | 0.092 | -0.001 |
| 2.755176757198216 | -0.585 | 0.096 | -0.002 |
| 2.758318349851806 | -0.59 | 0.101 | -0.002 |
| 2.761459942505395 | -0.595 | 0.105 | -0.002 |
| 2.764601535158985 | -0.601 | 0.109 | -0.003 |
| 2.767743127812574 | -0.606 | 0.114 | -0.003 |
| 2.770884720466164 | -0.611 | 0.119 | -0.003 |
| 2.774026313119754 | -0.616 | 0.124 | -0.004 |
| 2.777167905773343 | -0.622 | 0.129 | -0.004 |
| 2.780309498426932 | -0.627 | 0.134 | -0.005 |
| 2.783451091080522 | -0.632 | 0.139 | -0.006 |
| 2.786592683734112 | -0.637 | 0.144 | -0.006 |
| 2.789734276387701 | -0.642 | 0.15 | -0.007 |
| 2.792875869041291 | -0.648 | 0.155 | -0.008 |
| 2.796017461694881 | -0.653 | 0.161 | -0.009 |
| 2.79915905434847 | -0.658 | 0.167 | -0.01 |
| 2.80230064700206 | -0.663 | 0.173 | -0.011 |
| 2.80544223965565 | -0.668 | 0.179 | -0.012 |
| 2.808583832309239 | -0.673 | 0.186 | -0.014 |
| 2.811725424962829 | -0.678 | 0.192 | -0.015 |
| 2.814867017616419 | -0.684 | 0.199 | -0.017 |
| 2.818008610270008 | -0.689 | 0.206 | -0.018 |
| 2.821150202923598 | -0.694 | 0.213 | -0.02 |
| 2.824291795577187 | -0.699 | 0.22 | -0.022 |
| 2.827433388230777 | -0.704 | 0.227 | -0.024 |
| 2.830574980884366 | -0.709 | 0.234 | -0.027 |
| 2.833716573537956 | -0.714 | 0.242 | -0.029 |
| 2.836858166191546 | -0.719 | 0.249 | -0.032 |
| 2.839999758845135 | -0.724 | 0.257 | -0.034 |
| 2.843141351498725 | -0.729 | 0.265 | -0.037 |
| 2.846282944152314 | -0.734 | 0.273 | -0.041 |
| 2.849424536805904 | -0.739 | 0.281 | -0.044 |
| 2.852566129459494 | -0.743 | 0.289 | -0.047 |
| 2.855707722113083 | -0.748 | 0.297 | -0.051 |
| 2.858849314766673 | -0.753 | 0.306 | -0.055 |
| 2.861990907420262 | -0.758 | 0.314 | -0.06 |
| 2.865132500073852 | -0.763 | 0.323 | -0.064 |
| 2.868274092727442 | -0.767 | 0.332 | -0.069 |
| 2.871415685381031 | -0.772 | 0.341 | -0.074 |
| 2.874557278034621 | -0.777 | 0.35 | -0.079 |
| 2.87769887068821 | -0.781 | 0.359 | -0.085 |
| 2.8808404633418 | -0.786 | 0.368 | -0.09 |
| 2.88398205599539 | -0.791 | 0.378 | -0.096 |
| 2.88712364864898 | -0.795 | 0.387 | -0.103 |
| 2.890265241302569 | -0.8 | 0.397 | -0.109 |
| 2.893406833956158 | -0.804 | 0.406 | -0.116 |
| 2.896548426609748 | -0.809 | 0.416 | -0.124 |
| 2.899690019263338 | -0.813 | 0.426 | -0.131 |
| 2.902831611916927 | -0.818 | 0.436 | -0.139 |
| 2.905973204570517 | -0.822 | 0.446 | -0.147 |
| 2.909114797224106 | -0.826 | 0.456 | -0.155 |
| 2.912256389877696 | -0.831 | 0.466 | -0.164 |
| 2.915397982531286 | -0.835 | 0.476 | -0.173 |
| 2.918539575184875 | -0.839 | 0.486 | -0.183 |
| 2.921681167838465 | -0.843 | 0.497 | -0.192 |
| 2.924822760492054 | -0.847 | 0.507 | -0.202 |
| 2.927964353145644 | -0.851 | 0.517 | -0.213 |
| 2.931105945799234 | -0.855 | 0.528 | -0.223 |
| 2.934247538452823 | -0.859 | 0.538 | -0.234 |
| 2.937389131106413 | -0.863 | 0.548 | -0.245 |
| 2.940530723760002 | -0.867 | 0.559 | -0.257 |
| 2.943672316413592 | -0.871 | 0.569 | -0.269 |
| 2.946813909067182 | -0.875 | 0.58 | -0.281 |
| 2.949955501720771 | -0.879 | 0.59 | -0.293 |
| 2.953097094374361 | -0.882 | 0.601 | -0.306 |
| 2.95623868702795 | -0.886 | 0.611 | -0.319 |
| 2.95938027968154 | -0.89 | 0.622 | -0.332 |
| 2.96252187233513 | -0.893 | 0.632 | -0.345 |
| 2.965663464988719 | -0.897 | 0.642 | -0.359 |
| 2.968805057642309 | -0.9 | 0.653 | -0.373 |
| 2.971946650295898 | -0.904 | 0.663 | -0.387 |
| 2.975088242949488 | -0.907 | 0.673 | -0.402 |
| 2.978229835603078 | -0.91 | 0.684 | -0.416 |
| 2.981371428256667 | -0.914 | 0.694 | -0.431 |
| 2.984513020910257 | -0.917 | 0.704 | -0.446 |
| 2.987654613563846 | -0.92 | 0.714 | -0.461 |
| 2.990796206217436 | -0.923 | 0.724 | -0.476 |
| 2.993937798871025 | -0.926 | 0.734 | -0.491 |
| 2.997079391524615 | -0.929 | 0.743 | -0.507 |
| 3.000220984178205 | -0.932 | 0.753 | -0.522 |
| 3.003362576831794 | -0.935 | 0.763 | -0.538 |
| 3.006504169485384 | -0.938 | 0.772 | -0.554 |
| 3.009645762138974 | -0.941 | 0.781 | -0.569 |
| 3.012787354792563 | -0.943 | 0.791 | -0.585 |
| 3.015928947446153 | -0.946 | 0.8 | -0.601 |
| 3.019070540099742 | -0.949 | 0.809 | -0.616 |
| 3.022212132753332 | -0.951 | 0.818 | -0.632 |
| 3.025353725406922 | -0.954 | 0.826 | -0.648 |
| 3.028495318060511 | -0.956 | 0.835 | -0.663 |
| 3.031636910714101 | -0.958 | 0.843 | -0.678 |
| 3.03477850336769 | -0.961 | 0.851 | -0.694 |
| 3.03792009602128 | -0.963 | 0.859 | -0.709 |
| 3.04106168867487 | -0.965 | 0.867 | -0.724 |
| 3.04420328132846 | -0.967 | 0.875 | -0.739 |
| 3.047344873982049 | -0.969 | 0.882 | -0.753 |
| 3.050486466635638 | -0.971 | 0.89 | -0.767 |
| 3.053628059289228 | -0.973 | 0.897 | -0.781 |
| 3.056769651942818 | -0.975 | 0.904 | -0.795 |
| 3.059911244596407 | -0.977 | 0.91 | -0.809 |
| 3.063052837249997 | -0.979 | 0.917 | -0.822 |
| 3.066194429903586 | -0.98 | 0.923 | -0.835 |
| 3.069336022557176 | -0.982 | 0.929 | -0.847 |
| 3.072477615210766 | -0.983 | 0.935 | -0.859 |
| 3.075619207864355 | -0.985 | 0.941 | -0.871 |
| 3.078760800517945 | -0.986 | 0.946 | -0.882 |
| 3.081902393171534 | -0.988 | 0.951 | -0.893 |
| 3.085043985825124 | -0.989 | 0.956 | -0.904 |
| 3.088185578478713 | -0.99 | 0.961 | -0.914 |
| 3.091327171132303 | -0.991 | 0.965 | -0.923 |
| 3.094468763785893 | -0.992 | 0.969 | -0.932 |
| 3.097610356439482 | -0.993 | 0.973 | -0.941 |
| 3.100751949093072 | -0.994 | 0.977 | -0.949 |
| 3.103893541746661 | -0.995 | 0.98 | -0.956 |
| 3.107035134400251 | -0.996 | 0.983 | -0.963 |
| 3.110176727053841 | -0.997 | 0.986 | -0.969 |
| 3.11331831970743 | -0.997 | 0.989 | -0.975 |
| 3.11645991236102 | -0.998 | 0.991 | -0.98 |
| 3.11960150501461 | -0.998 | 0.993 | -0.985 |
| 3.122743097668199 | -0.999 | 0.995 | -0.989 |
| 3.125884690321789 | -0.999 | 0.997 | -0.992 |
| 3.129026282975378 | -0.999 | 0.998 | -0.995 |
| 3.132167875628968 | -1 | 0.999 | -0.997 |
| 3.135309468282557 | -1 | 0.999 | -0.999 |
| 3.138451060936147 | -1 | 1 | -1 |
| 3.141592653589737 | -1 | 1 | -1 |
| 3.144734246243326 | -1 | 1 | -1 |
| 3.147875838896916 | -1 | 0.999 | -0.999 |
| 3.151017431550505 | -1 | 0.999 | -0.997 |
| 3.154159024204095 | -0.999 | 0.998 | -0.995 |
| 3.157300616857685 | -0.999 | 0.997 | -0.992 |
| 3.160442209511274 | -0.999 | 0.995 | -0.989 |
| 3.163583802164864 | -0.998 | 0.993 | -0.985 |
| 3.166725394818453 | -0.998 | 0.991 | -0.98 |
| 3.169866987472043 | -0.997 | 0.989 | -0.975 |
| 3.173008580125633 | -0.997 | 0.986 | -0.969 |
| 3.176150172779222 | -0.996 | 0.983 | -0.963 |
| 3.179291765432812 | -0.995 | 0.98 | -0.956 |
| 3.182433358086401 | -0.994 | 0.977 | -0.949 |
| 3.185574950739991 | -0.993 | 0.973 | -0.941 |
| 3.188716543393581 | -0.992 | 0.969 | -0.932 |
| 3.19185813604717 | -0.991 | 0.965 | -0.923 |
| 3.19499972870076 | -0.99 | 0.961 | -0.914 |
| 3.198141321354349 | -0.989 | 0.956 | -0.904 |
| 3.20128291400794 | -0.988 | 0.951 | -0.893 |
| 3.204424506661528 | -0.986 | 0.946 | -0.882 |
| 3.207566099315118 | -0.985 | 0.941 | -0.871 |
| 3.210707691968708 | -0.983 | 0.935 | -0.859 |
| 3.213849284622297 | -0.982 | 0.929 | -0.847 |
| 3.216990877275887 | -0.98 | 0.923 | -0.835 |
| 3.220132469929476 | -0.979 | 0.917 | -0.822 |
| 3.223274062583066 | -0.977 | 0.91 | -0.809 |
| 3.226415655236656 | -0.975 | 0.904 | -0.795 |
| 3.229557247890245 | -0.973 | 0.897 | -0.781 |
| 3.232698840543835 | -0.971 | 0.89 | -0.767 |
| 3.235840433197425 | -0.969 | 0.882 | -0.753 |
| 3.238982025851014 | -0.967 | 0.875 | -0.739 |
| 3.242123618504604 | -0.965 | 0.867 | -0.724 |
| 3.245265211158193 | -0.963 | 0.859 | -0.709 |
| 3.248406803811783 | -0.961 | 0.851 | -0.694 |
| 3.251548396465373 | -0.958 | 0.843 | -0.678 |
| 3.254689989118962 | -0.956 | 0.835 | -0.663 |
| 3.257831581772551 | -0.954 | 0.826 | -0.648 |
| 3.260973174426141 | -0.951 | 0.818 | -0.632 |
| 3.26411476707973 | -0.949 | 0.809 | -0.616 |
| 3.267256359733321 | -0.946 | 0.8 | -0.601 |
| 3.27039795238691 | -0.943 | 0.791 | -0.585 |
| 3.2735395450405 | -0.941 | 0.781 | -0.569 |
| 3.276681137694089 | -0.938 | 0.772 | -0.554 |
| 3.279822730347679 | -0.935 | 0.763 | -0.538 |
| 3.282964323001269 | -0.932 | 0.753 | -0.522 |
| 3.286105915654858 | -0.929 | 0.743 | -0.507 |
| 3.289247508308448 | -0.926 | 0.734 | -0.491 |
| 3.292389100962037 | -0.923 | 0.724 | -0.476 |
| 3.295530693615627 | -0.92 | 0.714 | -0.461 |
| 3.298672286269217 | -0.917 | 0.704 | -0.446 |
| 3.301813878922806 | -0.914 | 0.694 | -0.431 |
| 3.304955471576396 | -0.91 | 0.684 | -0.416 |
| 3.308097064229985 | -0.907 | 0.673 | -0.402 |
| 3.311238656883575 | -0.904 | 0.663 | -0.387 |
| 3.314380249537165 | -0.9 | 0.653 | -0.373 |
| 3.317521842190754 | -0.897 | 0.642 | -0.359 |
| 3.320663434844344 | -0.893 | 0.632 | -0.345 |
| 3.323805027497933 | -0.89 | 0.622 | -0.332 |
| 3.326946620151523 | -0.886 | 0.611 | -0.319 |
| 3.330088212805113 | -0.882 | 0.601 | -0.306 |
| 3.333229805458702 | -0.879 | 0.59 | -0.293 |
| 3.336371398112292 | -0.875 | 0.58 | -0.281 |
| 3.339512990765881 | -0.871 | 0.569 | -0.269 |
| 3.342654583419471 | -0.867 | 0.559 | -0.257 |
| 3.345796176073061 | -0.863 | 0.548 | -0.245 |
| 3.34893776872665 | -0.859 | 0.538 | -0.234 |
| 3.35207936138024 | -0.855 | 0.528 | -0.223 |
| 3.355220954033829 | -0.851 | 0.517 | -0.213 |
| 3.358362546687419 | -0.847 | 0.507 | -0.202 |
| 3.361504139341009 | -0.843 | 0.497 | -0.192 |
| 3.364645731994598 | -0.839 | 0.486 | -0.183 |
| 3.367787324648188 | -0.835 | 0.476 | -0.173 |
| 3.370928917301777 | -0.831 | 0.466 | -0.164 |
| 3.374070509955367 | -0.826 | 0.456 | -0.155 |
| 3.377212102608956 | -0.822 | 0.446 | -0.147 |
| 3.380353695262546 | -0.818 | 0.436 | -0.139 |
| 3.383495287916136 | -0.813 | 0.426 | -0.131 |
| 3.386636880569725 | -0.809 | 0.416 | -0.124 |
| 3.389778473223315 | -0.804 | 0.406 | -0.116 |
| 3.392920065876904 | -0.8 | 0.397 | -0.109 |
| 3.396061658530494 | -0.795 | 0.387 | -0.103 |
| 3.399203251184084 | -0.791 | 0.378 | -0.096 |
| 3.402344843837673 | -0.786 | 0.368 | -0.09 |
| 3.405486436491263 | -0.781 | 0.359 | -0.085 |
| 3.408628029144852 | -0.777 | 0.35 | -0.079 |
| 3.411769621798442 | -0.772 | 0.341 | -0.074 |
| 3.414911214452032 | -0.767 | 0.332 | -0.069 |
| 3.418052807105621 | -0.763 | 0.323 | -0.064 |
| 3.421194399759211 | -0.758 | 0.314 | -0.06 |
| 3.4243359924128 | -0.753 | 0.306 | -0.055 |
| 3.42747758506639 | -0.748 | 0.297 | -0.051 |
| 3.43061917771998 | -0.743 | 0.289 | -0.047 |
| 3.433760770373569 | -0.739 | 0.281 | -0.044 |
| 3.436902363027159 | -0.734 | 0.273 | -0.041 |
| 3.440043955680748 | -0.729 | 0.265 | -0.037 |
| 3.443185548334338 | -0.724 | 0.257 | -0.034 |
| 3.446327140987927 | -0.719 | 0.249 | -0.032 |
| 3.449468733641517 | -0.714 | 0.242 | -0.029 |
| 3.452610326295107 | -0.709 | 0.234 | -0.027 |
| 3.455751918948696 | -0.704 | 0.227 | -0.024 |
| 3.458893511602286 | -0.699 | 0.22 | -0.022 |
| 3.462035104255876 | -0.694 | 0.213 | -0.02 |
| 3.465176696909465 | -0.689 | 0.206 | -0.018 |
| 3.468318289563055 | -0.684 | 0.199 | -0.017 |
| 3.471459882216644 | -0.678 | 0.192 | -0.015 |
| 3.474601474870234 | -0.673 | 0.186 | -0.014 |
| 3.477743067523824 | -0.668 | 0.179 | -0.012 |
| 3.480884660177413 | -0.663 | 0.173 | -0.011 |
| 3.484026252831002 | -0.658 | 0.167 | -0.01 |
| 3.487167845484592 | -0.653 | 0.161 | -0.009 |
| 3.490309438138182 | -0.648 | 0.155 | -0.008 |
| 3.493451030791772 | -0.642 | 0.15 | -0.007 |
| 3.496592623445361 | -0.637 | 0.144 | -0.006 |
| 3.499734216098951 | -0.632 | 0.139 | -0.006 |
| 3.50287580875254 | -0.627 | 0.134 | -0.005 |
| 3.50601740140613 | -0.622 | 0.129 | -0.004 |
| 3.50915899405972 | -0.616 | 0.124 | -0.004 |
| 3.512300586713309 | -0.611 | 0.119 | -0.003 |
| 3.515442179366899 | -0.606 | 0.114 | -0.003 |
| 3.518583772020488 | -0.601 | 0.109 | -0.003 |
| 3.521725364674078 | -0.595 | 0.105 | -0.002 |
| 3.524866957327668 | -0.59 | 0.101 | -0.002 |
| 3.528008549981257 | -0.585 | 0.096 | -0.002 |
| 3.531150142634847 | -0.58 | 0.092 | -0.001 |
| 3.534291735288436 | -0.575 | 0.088 | -0.001 |
| 3.537433327942026 | -0.569 | 0.085 | -0.001 |
| 3.540574920595616 | -0.564 | 0.081 | -0.001 |
| 3.543716513249205 | -0.559 | 0.077 | -0.001 |
| 3.546858105902795 | -0.554 | 0.074 | -0.001 |
| 3.549999698556384 | -0.548 | 0.07 | -0.001 |
| 3.553141291209974 | -0.543 | 0.067 | 0 |
| 3.556282883863564 | -0.538 | 0.064 | 0 |
| 3.559424476517153 | -0.533 | 0.061 | 0 |
| 3.562566069170743 | -0.528 | 0.058 | 0 |
| 3.565707661824332 | -0.522 | 0.055 | 0 |
| 3.568849254477922 | -0.517 | 0.053 | 0 |
| 3.571990847131511 | -0.512 | 0.05 | 0 |
| 3.575132439785101 | -0.507 | 0.047 | 0 |
| 3.578274032438691 | -0.502 | 0.045 | 0 |
| 3.58141562509228 | -0.497 | 0.043 | 0 |
| 3.58455721774587 | -0.491 | 0.041 | 0 |
| 3.58769881039946 | -0.486 | 0.038 | 0 |
| 3.590840403053049 | -0.481 | 0.036 | 0 |
| 3.593981995706639 | -0.476 | 0.034 | 0 |
| 3.597123588360228 | -0.471 | 0.032 | 0 |
| 3.600265181013818 | -0.466 | 0.031 | 0 |
| 3.603406773667407 | -0.461 | 0.029 | 0 |
| 3.606548366320997 | -0.456 | 0.027 | 0 |
| 3.609689958974587 | -0.451 | 0.026 | 0 |
| 3.612831551628176 | -0.446 | 0.024 | 0 |
| 3.615973144281766 | -0.441 | 0.023 | 0 |
| 3.619114736935355 | -0.436 | 0.021 | 0 |
| 3.622256329588945 | -0.431 | 0.02 | 0 |
| 3.625397922242534 | -0.426 | 0.019 | 0 |
| 3.628539514896124 | -0.421 | 0.018 | 0 |
| 3.631681107549714 | -0.416 | 0.017 | 0 |
| 3.634822700203303 | -0.411 | 0.016 | 0 |
| 3.637964292856893 | -0.406 | 0.015 | 0 |
| 3.641105885510483 | -0.402 | 0.014 | 0 |
| 3.644247478164072 | -0.397 | 0.013 | 0 |
| 3.647389070817662 | -0.392 | 0.012 | 0 |
| 3.650530663471251 | -0.387 | 0.011 | 0 |
| 3.653672256124841 | -0.383 | 0.01 | 0 |
| 3.656813848778431 | -0.378 | 0.01 | 0 |
| 3.65995544143202 | -0.373 | 0.009 | 0 |
| 3.66309703408561 | -0.368 | 0.008 | 0 |
| 3.666238626739199 | -0.364 | 0.008 | 0 |
| 3.66938021939279 | -0.359 | 0.007 | 0 |
| 3.672521812046378 | -0.355 | 0.007 | 0 |
| 3.675663404699968 | -0.35 | 0.006 | 0 |
| 3.678804997353558 | -0.345 | 0.006 | 0 |
| 3.681946590007147 | -0.341 | 0.005 | 0 |
| 3.685088182660737 | -0.336 | 0.005 | 0 |
| 3.688229775314326 | -0.332 | 0.004 | 0 |
| 3.691371367967916 | -0.328 | 0.004 | 0 |
| 3.694512960621506 | -0.323 | 0.004 | 0 |
| 3.697654553275095 | -0.319 | 0.003 | 0 |
| 3.700796145928685 | -0.314 | 0.003 | 0 |
| 3.703937738582274 | -0.31 | 0.003 | 0 |
| 3.707079331235864 | -0.306 | 0.003 | 0 |
| 3.710220923889454 | -0.302 | 0.002 | 0 |
| 3.713362516543043 | -0.297 | 0.002 | 0 |
| 3.716504109196633 | -0.293 | 0.002 | 0 |
| 3.719645701850223 | -0.289 | 0.002 | 0 |
| 3.722787294503812 | -0.285 | 0.002 | 0 |
| 3.725928887157402 | -0.281 | 0.001 | 0 |
| 3.729070479810991 | -0.277 | 0.001 | 0 |
| 3.732212072464581 | -0.273 | 0.001 | 0 |
| 3.735353665118171 | -0.269 | 0.001 | 0 |
| 3.73849525777176 | -0.265 | 0.001 | 0 |
| 3.74163685042535 | -0.261 | 0.001 | 0 |
| 3.744778443078939 | -0.257 | 0.001 | 0 |
| 3.747920035732529 | -0.253 | 0.001 | 0 |
| 3.751061628386119 | -0.249 | 0.001 | 0 |
| 3.754203221039708 | -0.245 | 0.001 | 0 |
| 3.757344813693298 | -0.242 | 0 | 0 |
| 3.760486406346887 | -0.238 | 0 | 0 |
| 3.763627999000477 | -0.234 | 0 | 0 |
| 3.766769591654067 | -0.23 | 0 | 0 |
| 3.769911184307656 | -0.227 | 0 | 0 |
| 3.773052776961246 | -0.223 | 0 | 0 |
| 3.776194369614835 | -0.22 | 0 | 0 |
| 3.779335962268425 | -0.216 | 0 | 0 |
| 3.782477554922014 | -0.213 | 0 | 0.001 |
| 3.785619147575604 | -0.209 | 0 | 0.001 |
| 3.788760740229193 | -0.206 | 0 | 0.001 |
| 3.791902332882783 | -0.202 | 0 | 0.001 |
| 3.795043925536373 | -0.199 | 0 | 0.001 |
| 3.798185518189962 | -0.196 | 0 | 0.001 |
| 3.801327110843552 | -0.192 | 0 | 0.002 |
| 3.804468703497142 | -0.189 | 0 | 0.002 |
| 3.807610296150731 | -0.186 | 0 | 0.002 |
| 3.810751888804321 | -0.183 | 0 | 0.002 |
| 3.813893481457911 | -0.179 | 0 | 0.003 |
| 3.8170350741115 | -0.176 | 0 | 0.003 |
| 3.82017666676509 | -0.173 | 0 | 0.004 |
| 3.823318259418679 | -0.17 | 0 | 0.004 |
| 3.826459852072269 | -0.167 | 0 | 0.005 |
| 3.829601444725859 | -0.164 | 0 | 0.005 |
| 3.832743037379448 | -0.161 | 0 | 0.006 |
| 3.835884630033038 | -0.158 | 0 | 0.007 |
| 3.839026222686627 | -0.155 | 0 | 0.008 |
| 3.842167815340217 | -0.153 | 0 | 0.009 |
| 3.845309407993807 | -0.15 | 0 | 0.01 |
| 3.848451000647396 | -0.147 | 0 | 0.011 |
| 3.851592593300986 | -0.144 | 0 | 0.012 |
| 3.854734185954575 | -0.142 | 0 | 0.013 |
| 3.857875778608165 | -0.139 | 0 | 0.015 |
| 3.861017371261755 | -0.136 | 0 | 0.016 |
| 3.864158963915344 | -0.134 | 0 | 0.018 |
| 3.867300556568933 | -0.131 | 0 | 0.02 |
| 3.870442149222523 | -0.129 | 0 | 0.021 |
| 3.873583741876112 | -0.126 | 0 | 0.024 |
| 3.876725334529703 | -0.124 | 0 | 0.026 |
| 3.879866927183292 | -0.121 | 0 | 0.028 |
| 3.883008519836882 | -0.119 | 0 | 0.031 |
| 3.886150112490471 | -0.116 | 0 | 0.033 |
| 3.889291705144061 | -0.114 | 0 | 0.036 |
| 3.892433297797651 | -0.112 | 0 | 0.039 |
| 3.89557489045124 | -0.109 | 0 | 0.043 |
| 3.89871648310483 | -0.107 | 0 | 0.046 |
| 3.901858075758419 | -0.105 | 0 | 0.05 |
| 3.904999668412009 | -0.103 | 0 | 0.054 |
| 3.908141261065598 | -0.101 | 0 | 0.058 |
| 3.911282853719188 | -0.098 | 0 | 0.063 |
| 3.914424446372778 | -0.096 | 0 | 0.067 |
| 3.917566039026367 | -0.094 | 0 | 0.072 |
| 3.920707631679957 | -0.092 | 0 | 0.077 |
| 3.923849224333547 | -0.09 | 0 | 0.083 |
| 3.926990816987136 | -0.088 | 0 | 0.088 |
| 3.930132409640726 | -0.086 | 0 | 0.094 |
| 3.933274002294315 | -0.085 | 0 | 0.101 |
| 3.936415594947905 | -0.083 | 0 | 0.107 |
| 3.939557187601495 | -0.081 | 0 | 0.114 |
| 3.942698780255084 | -0.079 | 0 | 0.121 |
| 3.945840372908674 | -0.077 | 0 | 0.129 |
| 3.948981965562263 | -0.076 | 0 | 0.136 |
| 3.952123558215853 | -0.074 | 0 | 0.144 |
| 3.955265150869442 | -0.072 | 0 | 0.153 |
| 3.958406743523032 | -0.07 | 0 | 0.161 |
| 3.961548336176622 | -0.069 | 0 | 0.17 |
| 3.964689928830211 | -0.067 | 0 | 0.179 |
| 3.967831521483801 | -0.066 | 0 | 0.189 |
| 3.97097311413739 | -0.064 | 0 | 0.199 |
| 3.97411470679098 | -0.063 | 0 | 0.209 |
| 3.97725629944457 | -0.061 | 0 | 0.22 |
| 3.98039789209816 | -0.06 | 0 | 0.23 |
| 3.983539484751749 | -0.058 | 0 | 0.242 |
| 3.986681077405338 | -0.057 | 0 | 0.253 |
| 3.989822670058928 | -0.055 | 0 | 0.265 |
| 3.992964262712517 | -0.054 | 0 | 0.277 |
| 3.996105855366107 | -0.053 | 0 | 0.289 |
| 3.999247448019697 | -0.051 | 0 | 0.302 |
| 4.002389040673287 | -0.05 | 0 | 0.314 |
| 4.005530633326877 | -0.049 | 0 | 0.328 |
| 4.008672225980466 | -0.047 | 0 | 0.341 |
| 4.011813818634056 | -0.046 | 0 | 0.355 |
| 4.014955411287645 | -0.045 | 0 | 0.368 |
| 4.018097003941234 | -0.044 | 0 | 0.383 |
| 4.021238596594824 | -0.043 | 0 | 0.397 |
| 4.024380189248414 | -0.042 | 0 | 0.411 |
| 4.027521781902004 | -0.041 | 0 | 0.426 |
| 4.030663374555593 | -0.039 | 0 | 0.441 |
| 4.033804967209183 | -0.038 | 0 | 0.456 |
| 4.036946559862773 | -0.037 | 0 | 0.471 |
| 4.040088152516362 | -0.036 | 0 | 0.486 |
| 4.043229745169951 | -0.035 | 0 | 0.502 |
| 4.046371337823541 | -0.034 | 0 | 0.517 |
| 4.049512930477131 | -0.033 | 0 | 0.533 |
| 4.05265452313072 | -0.032 | 0 | 0.548 |
| 4.05579611578431 | -0.032 | 0 | 0.564 |
| 4.0589377084379 | -0.031 | 0 | 0.58 |
| 4.062079301091489 | -0.03 | 0 | 0.595 |
| 4.065220893745079 | -0.029 | 0 | 0.611 |
| 4.068362486398668 | -0.028 | 0 | 0.627 |
| 4.071504079052258 | -0.027 | 0 | 0.642 |
| 4.074645671705848 | -0.027 | 0 | 0.658 |
| 4.077787264359437 | -0.026 | 0 | 0.673 |
| 4.080928857013027 | -0.025 | 0 | 0.689 |
| 4.084070449666616 | -0.024 | 0 | 0.704 |
| 4.087212042320206 | -0.024 | 0 | 0.719 |
| 4.090353634973795 | -0.023 | 0 | 0.734 |
| 4.093495227627385 | -0.022 | 0 | 0.748 |
| 4.096636820280975 | -0.021 | 0 | 0.763 |
| 4.099778412934564 | -0.021 | -0.001 | 0.777 |
| 4.102920005588154 | -0.02 | -0.001 | 0.791 |
| 4.106061598241744 | -0.02 | -0.001 | 0.804 |
| 4.109203190895333 | -0.019 | -0.001 | 0.818 |
| 4.112344783548923 | -0.018 | -0.001 | 0.831 |
| 4.115486376202512 | -0.018 | -0.001 | 0.843 |
| 4.118627968856102 | -0.017 | -0.001 | 0.855 |
| 4.121769561509692 | -0.017 | -0.001 | 0.867 |
| 4.124911154163281 | -0.016 | -0.001 | 0.879 |
| 4.128052746816871 | -0.016 | -0.001 | 0.89 |
| 4.13119433947046 | -0.015 | -0.002 | 0.9 |
| 4.13433593212405 | -0.015 | -0.002 | 0.91 |
| 4.13747752477764 | -0.014 | -0.002 | 0.92 |
| 4.14061911743123 | -0.014 | -0.002 | 0.929 |
| 4.143760710084818 | -0.013 | -0.002 | 0.938 |
| 4.146902302738408 | -0.013 | -0.003 | 0.946 |
| 4.150043895391998 | -0.012 | -0.003 | 0.954 |
| 4.153185488045588 | -0.012 | -0.003 | 0.961 |
| 4.156327080699177 | -0.011 | -0.003 | 0.967 |
| 4.159468673352766 | -0.011 | -0.004 | 0.973 |
| 4.162610266006356 | -0.011 | -0.004 | 0.979 |
| 4.165751858659946 | -0.01 | -0.004 | 0.983 |
| 4.168893451313535 | -0.01 | -0.005 | 0.988 |
| 4.172035043967125 | -0.01 | -0.005 | 0.991 |
| 4.175176636620715 | -0.009 | -0.006 | 0.994 |
| 4.178318229274304 | -0.009 | -0.006 | 0.997 |
| 4.181459821927894 | -0.009 | -0.007 | 0.998 |
| 4.184601414581484 | -0.008 | -0.007 | 0.999 |
| 4.187743007235073 | -0.008 | -0.008 | 1 |
| 4.190884599888663 | -0.008 | -0.008 | 1 |
| 4.194026192542252 | -0.007 | -0.009 | 0.999 |
| 4.197167785195842 | -0.007 | -0.01 | 0.998 |
| 4.200309377849432 | -0.007 | -0.01 | 0.996 |
| 4.203450970503021 | -0.007 | -0.011 | 0.993 |
| 4.206592563156611 | -0.006 | -0.012 | 0.99 |
| 4.2097341558102 | -0.006 | -0.013 | 0.986 |
| 4.21287574846379 | -0.006 | -0.014 | 0.982 |
| 4.21601734111738 | -0.006 | -0.015 | 0.977 |
| 4.21915893377097 | -0.005 | -0.016 | 0.971 |
| 4.222300526424559 | -0.005 | -0.017 | 0.965 |
| 4.225442119078148 | -0.005 | -0.018 | 0.958 |
| 4.228583711731738 | -0.005 | -0.019 | 0.951 |
| 4.231725304385327 | -0.005 | -0.02 | 0.943 |
| 4.234866897038917 | -0.004 | -0.021 | 0.935 |
| 4.238008489692506 | -0.004 | -0.023 | 0.926 |
| 4.241150082346096 | -0.004 | -0.024 | 0.917 |
| 4.244291674999685 | -0.004 | -0.026 | 0.907 |
| 4.247433267653276 | -0.004 | -0.027 | 0.897 |
| 4.250574860306865 | -0.003 | -0.029 | 0.886 |
| 4.253716452960455 | -0.003 | -0.031 | 0.875 |
| 4.256858045614044 | -0.003 | -0.032 | 0.863 |
| 4.259999638267634 | -0.003 | -0.034 | 0.851 |
| 4.263141230921224 | -0.003 | -0.036 | 0.839 |
| 4.266282823574813 | -0.003 | -0.038 | 0.826 |
| 4.269424416228403 | -0.003 | -0.041 | 0.813 |
| 4.272566008881992 | -0.003 | -0.043 | 0.8 |
| 4.275707601535582 | -0.002 | -0.045 | 0.786 |
| 4.27884919418917 | -0.002 | -0.047 | 0.772 |
| 4.28199078684276 | -0.002 | -0.05 | 0.758 |
| 4.285132379496351 | -0.002 | -0.053 | 0.743 |
| 4.28827397214994 | -0.002 | -0.055 | 0.729 |
| 4.29141556480353 | -0.002 | -0.058 | 0.714 |
| 4.294557157457119 | -0.002 | -0.061 | 0.699 |
| 4.29769875011071 | -0.002 | -0.064 | 0.684 |
| 4.300840342764299 | -0.002 | -0.067 | 0.668 |
| 4.303981935417888 | -0.002 | -0.07 | 0.653 |
| 4.307123528071478 | -0.001 | -0.074 | 0.637 |
| 4.310265120725067 | -0.001 | -0.077 | 0.622 |
| 4.313406713378657 | -0.001 | -0.081 | 0.606 |
| 4.316548306032247 | -0.001 | -0.085 | 0.59 |
| 4.319689898685836 | -0.001 | -0.088 | 0.575 |
| 4.322831491339426 | -0.001 | -0.092 | 0.559 |
| 4.325973083993015 | -0.001 | -0.096 | 0.543 |
| 4.329114676646605 | -0.001 | -0.101 | 0.528 |
| 4.332256269300195 | -0.001 | -0.105 | 0.512 |
| 4.335397861953784 | -0.001 | -0.109 | 0.497 |
| 4.338539454607374 | -0.001 | -0.114 | 0.481 |
| 4.341681047260963 | -0.001 | -0.119 | 0.466 |
| 4.344822639914553 | -0.001 | -0.124 | 0.451 |
| 4.347964232568143 | -0.001 | -0.129 | 0.436 |
| 4.351105825221732 | -0.001 | -0.134 | 0.421 |
| 4.354247417875322 | -0.001 | -0.139 | 0.406 |
| 4.357389010528911 | -0.001 | -0.144 | 0.392 |
| 4.360530603182501 | -0.001 | -0.15 | 0.378 |
| 4.36367219583609 | -0.001 | -0.155 | 0.364 |
| 4.36681378848968 | -0.001 | -0.161 | 0.35 |
| 4.36995538114327 | 0 | -0.167 | 0.336 |
| 4.373096973796859 | 0 | -0.173 | 0.323 |
| 4.376238566450449 | 0 | -0.179 | 0.31 |
| 4.379380159104038 | 0 | -0.186 | 0.297 |
| 4.382521751757628 | 0 | -0.192 | 0.285 |
| 4.385663344411217 | 0 | -0.199 | 0.273 |
| 4.388804937064807 | 0 | -0.206 | 0.261 |
| 4.391946529718397 | 0 | -0.213 | 0.249 |
| 4.395088122371987 | 0 | -0.22 | 0.238 |
| 4.398229715025576 | 0 | -0.227 | 0.227 |
| 4.401371307679165 | 0 | -0.234 | 0.216 |
| 4.404512900332755 | 0 | -0.242 | 0.206 |
| 4.407654492986345 | 0 | -0.249 | 0.196 |
| 4.410796085639934 | 0 | -0.257 | 0.186 |
| 4.413937678293524 | 0 | -0.265 | 0.176 |
| 4.417079270947114 | 0 | -0.273 | 0.167 |
| 4.420220863600703 | 0 | -0.281 | 0.158 |
| 4.423362456254293 | 0 | -0.289 | 0.15 |
| 4.426504048907883 | 0 | -0.297 | 0.142 |
| 4.429645641561472 | 0 | -0.306 | 0.134 |
| 4.432787234215062 | 0 | -0.314 | 0.126 |
| 4.435928826868651 | 0 | -0.323 | 0.119 |
| 4.43907041952224 | 0 | -0.332 | 0.112 |
| 4.44221201217583 | 0 | -0.341 | 0.105 |
| 4.44535360482942 | 0 | -0.35 | 0.098 |
| 4.44849519748301 | 0 | -0.359 | 0.092 |
| 4.4516367901366 | 0 | -0.368 | 0.086 |
| 4.454778382790188 | 0 | -0.378 | 0.081 |
| 4.457919975443779 | 0 | -0.387 | 0.076 |
| 4.461061568097368 | 0 | -0.397 | 0.07 |
| 4.464203160750958 | 0 | -0.406 | 0.066 |
| 4.467344753404547 | 0 | -0.416 | 0.061 |
| 4.470486346058137 | 0 | -0.426 | 0.057 |
| 4.473627938711726 | 0 | -0.436 | 0.053 |
| 4.476769531365316 | 0 | -0.446 | 0.049 |
| 4.479911124018905 | 0 | -0.456 | 0.045 |
| 4.483052716672495 | 0 | -0.466 | 0.042 |
| 4.486194309326085 | 0 | -0.476 | 0.038 |
| 4.489335901979674 | 0 | -0.486 | 0.035 |
| 4.492477494633264 | 0 | -0.497 | 0.032 |
| 4.495619087286854 | 0 | -0.507 | 0.03 |
| 4.498760679940443 | 0 | -0.517 | 0.027 |
| 4.501902272594033 | 0 | -0.528 | 0.025 |
| 4.505043865247622 | 0 | -0.538 | 0.023 |
| 4.508185457901212 | 0 | -0.548 | 0.021 |
| 4.511327050554801 | 0 | -0.559 | 0.019 |
| 4.514468643208391 | 0 | -0.569 | 0.017 |
| 4.517610235861981 | 0 | -0.58 | 0.016 |
| 4.520751828515571 | 0 | -0.59 | 0.014 |
| 4.52389342116916 | 0 | -0.601 | 0.013 |
| 4.52703501382275 | 0 | -0.611 | 0.011 |
| 4.530176606476339 | 0 | -0.622 | 0.01 |
| 4.533318199129928 | 0 | -0.632 | 0.009 |
| 4.536459791783518 | 0 | -0.642 | 0.008 |
| 4.539601384437108 | 0 | -0.653 | 0.007 |
| 4.542742977090698 | 0 | -0.663 | 0.007 |
| 4.545884569744287 | 0 | -0.673 | 0.006 |
| 4.549026162397876 | 0 | -0.684 | 0.005 |
| 4.552167755051466 | 0 | -0.694 | 0.005 |
| 4.555309347705056 | 0 | -0.704 | 0.004 |
| 4.558450940358646 | 0 | -0.714 | 0.003 |
| 4.561592533012235 | 0 | -0.724 | 0.003 |
| 4.564734125665825 | 0 | -0.734 | 0.003 |
| 4.567875718319415 | 0 | -0.743 | 0.002 |
| 4.571017310973004 | 0 | -0.753 | 0.002 |
| 4.574158903626594 | 0 | -0.763 | 0.002 |
| 4.577300496280183 | 0 | -0.772 | 0.001 |
| 4.580442088933772 | 0 | -0.781 | 0.001 |
| 4.583583681587362 | 0 | -0.791 | 0.001 |
| 4.586725274240952 | 0 | -0.8 | 0.001 |
| 4.589866866894542 | 0 | -0.809 | 0.001 |
| 4.593008459548131 | 0 | -0.818 | 0.001 |
| 4.596150052201721 | 0 | -0.826 | 0.001 |
| 4.59929164485531 | 0 | -0.835 | 0 |
| 4.6024332375089 | 0 | -0.843 | 0 |
| 4.60557483016249 | 0 | -0.851 | 0 |
| 4.608716422816079 | 0 | -0.859 | 0 |
| 4.611858015469668 | 0 | -0.867 | 0 |
| 4.614999608123258 | 0 | -0.875 | 0 |
| 4.618141200776848 | 0 | -0.882 | 0 |
| 4.621282793430437 | 0 | -0.89 | 0 |
| 4.624424386084027 | 0 | -0.897 | 0 |
| 4.627565978737617 | 0 | -0.904 | 0 |
| 4.630707571391206 | 0 | -0.91 | 0 |
| 4.633849164044795 | 0 | -0.917 | 0 |
| 4.636990756698386 | 0 | -0.923 | 0 |
| 4.640132349351975 | 0 | -0.929 | 0 |
| 4.643273942005564 | 0 | -0.935 | 0 |
| 4.646415534659154 | 0 | -0.941 | 0 |
| 4.649557127312744 | 0 | -0.946 | 0 |
| 4.652698719966334 | 0 | -0.951 | 0 |
| 4.655840312619923 | 0 | -0.956 | 0 |
| 4.658981905273513 | 0 | -0.961 | 0 |
| 4.662123497927102 | 0 | -0.965 | 0 |
| 4.665265090580692 | 0 | -0.969 | 0 |
| 4.668406683234282 | 0 | -0.973 | 0 |
| 4.671548275887871 | 0 | -0.977 | 0 |
| 4.674689868541461 | 0 | -0.98 | 0 |
| 4.67783146119505 | 0 | -0.983 | 0 |
| 4.68097305384864 | 0 | -0.986 | 0 |
| 4.68411464650223 | 0 | -0.989 | 0 |
| 4.687256239155819 | 0 | -0.991 | 0 |
| 4.690397831809409 | 0 | -0.993 | 0 |
| 4.693539424462998 | 0 | -0.995 | 0 |
| 4.696681017116588 | 0 | -0.997 | 0 |
| 4.699822609770177 | 0 | -0.998 | 0 |
| 4.702964202423767 | 0 | -0.999 | 0 |
| 4.706105795077356 | 0 | -0.999 | 0 |
| 4.709247387730946 | 0 | -1 | 0 |
| 4.712388980384535 | 0 | -1 | 0 |
| 4.715530573038126 | 0 | -1 | 0 |
| 4.718672165691715 | 0 | -0.999 | 0 |
| 4.721813758345305 | 0 | -0.999 | 0 |
| 4.724955350998894 | 0 | -0.998 | 0 |
| 4.728096943652484 | 0 | -0.997 | 0 |
| 4.731238536306074 | 0 | -0.995 | 0 |
| 4.734380128959663 | 0 | -0.993 | 0 |
| 4.737521721613253 | 0 | -0.991 | 0 |
| 4.740663314266842 | 0 | -0.989 | 0 |
| 4.743804906920432 | 0 | -0.986 | 0 |
| 4.74694649957402 | 0 | -0.983 | 0 |
| 4.750088092227611 | 0 | -0.98 | 0 |
| 4.7532296848812 | 0 | -0.977 | 0 |
| 4.75637127753479 | 0 | -0.973 | 0 |
| 4.75951287018838 | 0 | -0.969 | 0 |
| 4.76265446284197 | 0 | -0.965 | 0 |
| 4.765796055495559 | 0 | -0.961 | 0 |
| 4.768937648149149 | 0 | -0.956 | 0 |
| 4.772079240802738 | 0 | -0.951 | 0 |
| 4.775220833456327 | 0 | -0.946 | 0 |
| 4.778362426109917 | 0 | -0.941 | 0 |
| 4.781504018763507 | 0 | -0.935 | 0 |
| 4.784645611417097 | 0 | -0.929 | 0 |
| 4.787787204070686 | 0 | -0.923 | 0 |
| 4.790928796724275 | 0 | -0.917 | 0 |
| 4.794070389377865 | 0 | -0.91 | 0 |
| 4.797211982031455 | 0 | -0.904 | 0 |
| 4.800353574685045 | 0 | -0.897 | 0 |
| 4.803495167338634 | 0 | -0.89 | 0 |
| 4.806636759992224 | 0 | -0.882 | 0 |
| 4.809778352645814 | 0 | -0.875 | 0 |
| 4.812919945299403 | 0 | -0.867 | 0 |
| 4.816061537952993 | 0 | -0.859 | 0 |
| 4.819203130606582 | 0 | -0.851 | 0 |
| 4.822344723260172 | 0 | -0.843 | 0 |
| 4.825486315913761 | 0 | -0.835 | 0 |
| 4.828627908567351 | 0 | -0.826 | -0.001 |
| 4.83176950122094 | 0 | -0.818 | -0.001 |
| 4.83491109387453 | 0 | -0.809 | -0.001 |
| 4.83805268652812 | 0 | -0.8 | -0.001 |
| 4.841194279181709 | 0 | -0.791 | -0.001 |
| 4.844335871835299 | 0 | -0.781 | -0.001 |
| 4.847477464488889 | 0 | -0.772 | -0.001 |
| 4.850619057142478 | 0 | -0.763 | -0.002 |
| 4.853760649796068 | 0 | -0.753 | -0.002 |
| 4.856902242449657 | 0 | -0.743 | -0.002 |
| 4.860043835103247 | 0 | -0.734 | -0.003 |
| 4.863185427756837 | 0 | -0.724 | -0.003 |
| 4.866327020410426 | 0 | -0.714 | -0.003 |
| 4.869468613064015 | 0 | -0.704 | -0.004 |
| 4.872610205717605 | 0 | -0.694 | -0.005 |
| 4.875751798371195 | 0 | -0.684 | -0.005 |
| 4.878893391024784 | 0 | -0.673 | -0.006 |
| 4.882034983678374 | 0 | -0.663 | -0.007 |
| 4.885176576331964 | 0 | -0.653 | -0.007 |
| 4.888318168985553 | 0 | -0.642 | -0.008 |
| 4.891459761639143 | 0 | -0.632 | -0.009 |
| 4.894601354292733 | 0 | -0.622 | -0.01 |
| 4.897742946946322 | 0 | -0.611 | -0.011 |
| 4.900884539599912 | 0 | -0.601 | -0.013 |
| 4.904026132253501 | 0 | -0.59 | -0.014 |
| 4.907167724907091 | 0 | -0.58 | -0.016 |
| 4.91030931756068 | 0 | -0.569 | -0.017 |
| 4.91345091021427 | 0 | -0.559 | -0.019 |
| 4.91659250286786 | 0 | -0.548 | -0.021 |
| 4.91973409552145 | 0 | -0.538 | -0.023 |
| 4.922875688175039 | 0 | -0.528 | -0.025 |
| 4.926017280828628 | 0 | -0.517 | -0.027 |
| 4.929158873482218 | 0 | -0.507 | -0.03 |
| 4.932300466135808 | 0 | -0.497 | -0.032 |
| 4.935442058789397 | 0 | -0.486 | -0.035 |
| 4.938583651442987 | 0 | -0.476 | -0.038 |
| 4.941725244096576 | 0 | -0.466 | -0.042 |
| 4.944866836750166 | 0 | -0.456 | -0.045 |
| 4.948008429403755 | 0 | -0.446 | -0.049 |
| 4.951150022057345 | 0 | -0.436 | -0.053 |
| 4.954291614710935 | 0 | -0.426 | -0.057 |
| 4.957433207364524 | 0 | -0.416 | -0.061 |
| 4.960574800018114 | 0 | -0.406 | -0.066 |
| 4.963716392671704 | 0 | -0.397 | -0.07 |
| 4.966857985325293 | 0 | -0.387 | -0.076 |
| 4.969999577978883 | 0 | -0.378 | -0.081 |
| 4.973141170632472 | 0 | -0.368 | -0.086 |
| 4.976282763286062 | 0 | -0.359 | -0.092 |
| 4.979424355939651 | 0 | -0.35 | -0.098 |
| 4.982565948593241 | 0 | -0.341 | -0.105 |
| 4.985707541246831 | 0 | -0.332 | -0.112 |
| 4.98884913390042 | 0 | -0.323 | -0.119 |
| 4.99199072655401 | 0 | -0.314 | -0.126 |
| 4.9951323192076 | 0 | -0.306 | -0.134 |
| 4.99827391186119 | 0 | -0.297 | -0.142 |
| 5.00141550451478 | 0 | -0.289 | -0.15 |
| 5.004557097168369 | 0 | -0.281 | -0.158 |
| 5.007698689821958 | 0 | -0.273 | -0.167 |
| 5.010840282475548 | 0 | -0.265 | -0.176 |
| 5.013981875129137 | 0 | -0.257 | -0.186 |
| 5.017123467782727 | 0 | -0.249 | -0.196 |
| 5.020265060436317 | 0 | -0.242 | -0.206 |
| 5.023406653089906 | 0 | -0.234 | -0.216 |
| 5.026548245743496 | 0 | -0.227 | -0.227 |
| 5.029689838397085 | 0 | -0.22 | -0.238 |
| 5.032831431050674 | 0 | -0.213 | -0.249 |
| 5.035973023704264 | 0 | -0.206 | -0.261 |
| 5.039114616357854 | 0 | -0.199 | -0.273 |
| 5.042256209011444 | 0 | -0.192 | -0.285 |
| 5.045397801665033 | 0 | -0.186 | -0.297 |
| 5.048539394318622 | 0 | -0.179 | -0.31 |
| 5.051680986972213 | 0 | -0.173 | -0.323 |
| 5.054822579625802 | 0 | -0.167 | -0.336 |
| 5.057964172279392 | 0.001 | -0.161 | -0.35 |
| 5.061105764932981 | 0.001 | -0.155 | -0.364 |
| 5.064247357586571 | 0.001 | -0.15 | -0.378 |
| 5.067388950240161 | 0.001 | -0.144 | -0.392 |
| 5.07053054289375 | 0.001 | -0.139 | -0.406 |
| 5.07367213554734 | 0.001 | -0.134 | -0.421 |
| 5.07681372820093 | 0.001 | -0.129 | -0.436 |
| 5.079955320854519 | 0.001 | -0.124 | -0.451 |
| 5.083096913508108 | 0.001 | -0.119 | -0.466 |
| 5.086238506161698 | 0.001 | -0.114 | -0.481 |
| 5.089380098815288 | 0.001 | -0.109 | -0.497 |
| 5.092521691468877 | 0.001 | -0.105 | -0.512 |
| 5.095663284122466 | 0.001 | -0.101 | -0.528 |
| 5.098804876776057 | 0.001 | -0.096 | -0.543 |
| 5.101946469429646 | 0.001 | -0.092 | -0.559 |
| 5.105088062083236 | 0.001 | -0.088 | -0.575 |
| 5.108229654736825 | 0.001 | -0.085 | -0.59 |
| 5.111371247390415 | 0.001 | -0.081 | -0.606 |
| 5.114512840044005 | 0.001 | -0.077 | -0.622 |
| 5.117654432697594 | 0.001 | -0.074 | -0.637 |
| 5.120796025351184 | 0.002 | -0.07 | -0.653 |
| 5.123937618004773 | 0.002 | -0.067 | -0.668 |
| 5.127079210658363 | 0.002 | -0.064 | -0.684 |
| 5.130220803311953 | 0.002 | -0.061 | -0.699 |
| 5.133362395965542 | 0.002 | -0.058 | -0.714 |
| 5.136503988619131 | 0.002 | -0.055 | -0.729 |
| 5.13964558127272 | 0.002 | -0.053 | -0.743 |
| 5.142787173926311 | 0.002 | -0.05 | -0.758 |
| 5.1459287665799 | 0.002 | -0.047 | -0.772 |
| 5.14907035923349 | 0.002 | -0.045 | -0.786 |
| 5.15221195188708 | 0.003 | -0.043 | -0.8 |
| 5.15535354454067 | 0.003 | -0.041 | -0.813 |
| 5.158495137194259 | 0.003 | -0.038 | -0.826 |
| 5.161636729847848 | 0.003 | -0.036 | -0.839 |
| 5.164778322501438 | 0.003 | -0.034 | -0.851 |
| 5.167919915155028 | 0.003 | -0.032 | -0.863 |
| 5.171061507808617 | 0.003 | -0.031 | -0.875 |
| 5.174203100462206 | 0.003 | -0.029 | -0.886 |
| 5.177344693115796 | 0.004 | -0.027 | -0.897 |
| 5.180486285769386 | 0.004 | -0.026 | -0.907 |
| 5.183627878422976 | 0.004 | -0.024 | -0.917 |
| 5.186769471076565 | 0.004 | -0.023 | -0.926 |
| 5.189911063730155 | 0.004 | -0.021 | -0.935 |
| 5.193052656383744 | 0.005 | -0.02 | -0.943 |
| 5.196194249037334 | 0.005 | -0.019 | -0.951 |
| 5.199335841690924 | 0.005 | -0.018 | -0.958 |
| 5.202477434344513 | 0.005 | -0.017 | -0.965 |
| 5.205619026998103 | 0.005 | -0.016 | -0.971 |
| 5.208760619651692 | 0.006 | -0.015 | -0.977 |
| 5.211902212305282 | 0.006 | -0.014 | -0.982 |
| 5.215043804958871 | 0.006 | -0.013 | -0.986 |
| 5.218185397612461 | 0.006 | -0.012 | -0.99 |
| 5.221326990266051 | 0.007 | -0.011 | -0.993 |
| 5.22446858291964 | 0.007 | -0.01 | -0.996 |
| 5.22761017557323 | 0.007 | -0.01 | -0.998 |
| 5.23075176822682 | 0.007 | -0.009 | -0.999 |
| 5.23389336088041 | 0.008 | -0.008 | -1 |
| 5.237034953533999 | 0.008 | -0.008 | -1 |
| 5.240176546187588 | 0.008 | -0.007 | -0.999 |
| 5.243318138841178 | 0.009 | -0.007 | -0.998 |
| 5.246459731494767 | 0.009 | -0.006 | -0.997 |
| 5.249601324148357 | 0.009 | -0.006 | -0.994 |
| 5.252742916801947 | 0.01 | -0.005 | -0.991 |
| 5.255884509455536 | 0.01 | -0.005 | -0.988 |
| 5.259026102109125 | 0.01 | -0.004 | -0.983 |
| 5.262167694762715 | 0.011 | -0.004 | -0.979 |
| 5.265309287416305 | 0.011 | -0.004 | -0.973 |
| 5.268450880069895 | 0.011 | -0.003 | -0.967 |
| 5.271592472723484 | 0.012 | -0.003 | -0.961 |
| 5.274734065377074 | 0.012 | -0.003 | -0.954 |
| 5.277875658030664 | 0.013 | -0.003 | -0.946 |
| 5.281017250684253 | 0.013 | -0.002 | -0.938 |
| 5.284158843337843 | 0.014 | -0.002 | -0.929 |
| 5.287300435991432 | 0.014 | -0.002 | -0.92 |
| 5.290442028645022 | 0.015 | -0.002 | -0.91 |
| 5.293583621298612 | 0.015 | -0.002 | -0.9 |
| 5.296725213952201 | 0.016 | -0.001 | -0.89 |
| 5.299866806605791 | 0.016 | -0.001 | -0.879 |
| 5.30300839925938 | 0.017 | -0.001 | -0.867 |
| 5.30614999191297 | 0.017 | -0.001 | -0.855 |
| 5.30929158456656 | 0.018 | -0.001 | -0.843 |
| 5.312433177220149 | 0.018 | -0.001 | -0.831 |
| 5.315574769873739 | 0.019 | -0.001 | -0.818 |
| 5.318716362527328 | 0.02 | -0.001 | -0.804 |
| 5.321857955180918 | 0.02 | -0.001 | -0.791 |
| 5.324999547834508 | 0.021 | -0.001 | -0.777 |
| 5.328141140488097 | 0.021 | 0 | -0.763 |
| 5.331282733141686 | 0.022 | 0 | -0.748 |
| 5.334424325795276 | 0.023 | 0 | -0.734 |
| 5.337565918448866 | 0.024 | 0 | -0.719 |
| 5.340707511102456 | 0.024 | 0 | -0.704 |
| 5.343849103756045 | 0.025 | 0 | -0.689 |
| 5.346990696409634 | 0.026 | 0 | -0.673 |
| 5.350132289063224 | 0.027 | 0 | -0.658 |
| 5.353273881716814 | 0.027 | 0 | -0.642 |
| 5.356415474370403 | 0.028 | 0 | -0.627 |
| 5.359557067023993 | 0.029 | 0 | -0.611 |
| 5.362698659677583 | 0.03 | 0 | -0.595 |
| 5.365840252331172 | 0.031 | 0 | -0.58 |
| 5.368981844984762 | 0.032 | 0 | -0.564 |
| 5.372123437638351 | 0.032 | 0 | -0.548 |
| 5.375265030291941 | 0.033 | 0 | -0.533 |
| 5.378406622945531 | 0.034 | 0 | -0.517 |
| 5.38154821559912 | 0.035 | 0 | -0.502 |
| 5.38468980825271 | 0.036 | 0 | -0.486 |
| 5.387831400906299 | 0.037 | 0 | -0.471 |
| 5.39097299355989 | 0.038 | 0 | -0.456 |
| 5.394114586213479 | 0.039 | 0 | -0.441 |
| 5.397256178867068 | 0.041 | 0 | -0.426 |
| 5.400397771520657 | 0.042 | 0 | -0.411 |
| 5.403539364174247 | 0.043 | 0 | -0.397 |
| 5.406680956827837 | 0.044 | 0 | -0.383 |
| 5.409822549481426 | 0.045 | 0 | -0.368 |
| 5.412964142135016 | 0.046 | 0 | -0.355 |
| 5.416105734788605 | 0.047 | 0 | -0.341 |
| 5.419247327442195 | 0.049 | 0 | -0.328 |
| 5.422388920095785 | 0.05 | 0 | -0.314 |
| 5.425530512749375 | 0.051 | 0 | -0.302 |
| 5.428672105402964 | 0.053 | 0 | -0.289 |
| 5.431813698056554 | 0.054 | 0 | -0.277 |
| 5.434955290710143 | 0.055 | 0 | -0.265 |
| 5.438096883363733 | 0.057 | 0 | -0.253 |
| 5.441238476017322 | 0.058 | 0 | -0.242 |
| 5.444380068670912 | 0.06 | 0 | -0.23 |
| 5.447521661324502 | 0.061 | 0 | -0.22 |
| 5.450663253978091 | 0.063 | 0 | -0.209 |
| 5.453804846631681 | 0.064 | 0 | -0.199 |
| 5.456946439285271 | 0.066 | 0 | -0.189 |
| 5.46008803193886 | 0.067 | 0 | -0.179 |
| 5.46322962459245 | 0.069 | 0 | -0.17 |
| 5.466371217246039 | 0.07 | 0 | -0.161 |
| 5.46951280989963 | 0.072 | 0 | -0.153 |
| 5.472654402553218 | 0.074 | 0 | -0.144 |
| 5.475795995206808 | 0.076 | 0 | -0.136 |
| 5.478937587860398 | 0.077 | 0 | -0.129 |
| 5.482079180513987 | 0.079 | 0 | -0.121 |
| 5.485220773167577 | 0.081 | 0 | -0.114 |
| 5.488362365821166 | 0.083 | 0 | -0.107 |
| 5.491503958474756 | 0.085 | 0 | -0.101 |
| 5.494645551128346 | 0.086 | 0 | -0.094 |
| 5.497787143781935 | 0.088 | 0 | -0.088 |
| 5.500928736435525 | 0.09 | 0 | -0.083 |
| 5.504070329089115 | 0.092 | 0 | -0.077 |
| 5.507211921742704 | 0.094 | 0 | -0.072 |
| 5.510353514396294 | 0.096 | 0 | -0.067 |
| 5.513495107049883 | 0.098 | 0 | -0.063 |
| 5.516636699703473 | 0.101 | 0 | -0.058 |
| 5.519778292357062 | 0.103 | 0 | -0.054 |
| 5.522919885010652 | 0.105 | 0 | -0.05 |
| 5.526061477664242 | 0.107 | 0 | -0.046 |
| 5.529203070317831 | 0.109 | 0 | -0.043 |
| 5.532344662971421 | 0.112 | 0 | -0.039 |
| 5.535486255625011 | 0.114 | 0 | -0.036 |
| 5.5386278482786 | 0.116 | 0 | -0.033 |
| 5.54176944093219 | 0.119 | 0 | -0.031 |
| 5.544911033585779 | 0.121 | 0 | -0.028 |
| 5.54805262623937 | 0.124 | 0 | -0.026 |
| 5.551194218892959 | 0.126 | 0 | -0.024 |
| 5.554335811546548 | 0.129 | 0 | -0.021 |
| 5.557477404200137 | 0.131 | 0 | -0.02 |
| 5.560618996853727 | 0.134 | 0 | -0.018 |
| 5.563760589507317 | 0.136 | 0 | -0.016 |
| 5.566902182160906 | 0.139 | 0 | -0.015 |
| 5.570043774814496 | 0.142 | 0 | -0.013 |
| 5.573185367468086 | 0.144 | 0 | -0.012 |
| 5.576326960121675 | 0.147 | 0 | -0.011 |
| 5.579468552775264 | 0.15 | 0 | -0.01 |
| 5.582610145428854 | 0.153 | 0 | -0.009 |
| 5.585751738082444 | 0.155 | 0 | -0.008 |
| 5.588893330736034 | 0.158 | 0 | -0.007 |
| 5.592034923389623 | 0.161 | 0 | -0.006 |
| 5.595176516043213 | 0.164 | 0 | -0.005 |
| 5.598318108696803 | 0.167 | 0 | -0.005 |
| 5.601459701350392 | 0.17 | 0 | -0.004 |
| 5.604601294003982 | 0.173 | 0 | -0.004 |
| 5.607742886657571 | 0.176 | 0 | -0.003 |
| 5.610884479311161 | 0.179 | 0 | -0.003 |
| 5.61402607196475 | 0.183 | 0 | -0.002 |
| 5.61716766461834 | 0.186 | 0 | -0.002 |
| 5.62030925727193 | 0.189 | 0 | -0.002 |
| 5.623450849925519 | 0.192 | 0 | -0.002 |
| 5.626592442579109 | 0.196 | 0 | -0.001 |
| 5.629734035232698 | 0.199 | 0 | -0.001 |
| 5.632875627886288 | 0.202 | 0 | -0.001 |
| 5.636017220539878 | 0.206 | 0 | -0.001 |
| 5.639158813193467 | 0.209 | 0 | -0.001 |
| 5.642300405847057 | 0.213 | 0 | -0.001 |
| 5.645441998500646 | 0.216 | 0 | 0 |
| 5.648583591154236 | 0.22 | 0 | 0 |
| 5.651725183807825 | 0.223 | 0 | 0 |
| 5.654866776461415 | 0.227 | 0 | 0 |
| 5.658008369115005 | 0.23 | 0 | 0 |
| 5.661149961768594 | 0.234 | 0 | 0 |
| 5.664291554422184 | 0.238 | 0 | 0 |
| 5.667433147075774 | 0.242 | 0 | 0 |
| 5.670574739729363 | 0.245 | 0.001 | 0 |
| 5.673716332382953 | 0.249 | 0.001 | 0 |
| 5.676857925036542 | 0.253 | 0.001 | 0 |
| 5.679999517690132 | 0.257 | 0.001 | 0 |
| 5.683141110343721 | 0.261 | 0.001 | 0 |
| 5.686282702997311 | 0.265 | 0.001 | 0 |
| 5.689424295650901 | 0.269 | 0.001 | 0 |
| 5.69256588830449 | 0.273 | 0.001 | 0 |
| 5.69570748095808 | 0.277 | 0.001 | 0 |
| 5.69884907361167 | 0.281 | 0.001 | 0 |
| 5.701990666265259 | 0.285 | 0.002 | 0 |
| 5.705132258918849 | 0.289 | 0.002 | 0 |
| 5.708273851572438 | 0.293 | 0.002 | 0 |
| 5.711415444226028 | 0.297 | 0.002 | 0 |
| 5.714557036879618 | 0.302 | 0.002 | 0 |
| 5.717698629533207 | 0.306 | 0.003 | 0 |
| 5.720840222186797 | 0.31 | 0.003 | 0 |
| 5.723981814840386 | 0.314 | 0.003 | 0 |
| 5.727123407493976 | 0.319 | 0.003 | 0 |
| 5.730265000147565 | 0.323 | 0.004 | 0 |
| 5.733406592801155 | 0.328 | 0.004 | 0 |
| 5.736548185454744 | 0.332 | 0.004 | 0 |
| 5.739689778108334 | 0.336 | 0.005 | 0 |
| 5.742831370761924 | 0.341 | 0.005 | 0 |
| 5.745972963415514 | 0.345 | 0.006 | 0 |
| 5.749114556069103 | 0.35 | 0.006 | 0 |
| 5.752256148722693 | 0.355 | 0.007 | 0 |
| 5.755397741376282 | 0.359 | 0.007 | 0 |
| 5.758539334029872 | 0.364 | 0.008 | 0 |
| 5.761680926683462 | 0.368 | 0.008 | 0 |
| 5.764822519337051 | 0.373 | 0.009 | 0 |
| 5.767964111990641 | 0.378 | 0.01 | 0 |
| 5.77110570464423 | 0.383 | 0.01 | 0 |
| 5.77424729729782 | 0.387 | 0.011 | 0 |
| 5.77738888995141 | 0.392 | 0.012 | 0 |
| 5.780530482605 | 0.397 | 0.013 | 0 |
| 5.783672075258588 | 0.402 | 0.014 | 0 |
| 5.786813667912178 | 0.406 | 0.015 | 0 |
| 5.789955260565768 | 0.411 | 0.016 | 0 |
| 5.793096853219358 | 0.416 | 0.017 | 0 |
| 5.796238445872947 | 0.421 | 0.018 | 0 |
| 5.799380038526537 | 0.426 | 0.019 | 0 |
| 5.802521631180126 | 0.431 | 0.02 | 0 |
| 5.805663223833715 | 0.436 | 0.021 | 0 |
| 5.808804816487306 | 0.441 | 0.023 | 0 |
| 5.811946409140895 | 0.446 | 0.024 | 0 |
| 5.815088001794485 | 0.451 | 0.026 | 0 |
| 5.818229594448074 | 0.456 | 0.027 | 0 |
| 5.821371187101663 | 0.461 | 0.029 | 0 |
| 5.824512779755254 | 0.466 | 0.031 | 0 |
| 5.827654372408843 | 0.471 | 0.032 | 0 |
| 5.830795965062433 | 0.476 | 0.034 | 0 |
| 5.833937557716022 | 0.481 | 0.036 | 0 |
| 5.837079150369612 | 0.486 | 0.038 | 0 |
| 5.840220743023201 | 0.491 | 0.041 | 0 |
| 5.843362335676791 | 0.497 | 0.043 | 0 |
| 5.846503928330381 | 0.502 | 0.045 | 0 |
| 5.84964552098397 | 0.507 | 0.047 | 0 |
| 5.85278711363756 | 0.512 | 0.05 | 0 |
| 5.85592870629115 | 0.517 | 0.053 | 0 |
| 5.85907029894474 | 0.522 | 0.055 | 0 |
| 5.862211891598329 | 0.528 | 0.058 | 0 |
| 5.865353484251918 | 0.533 | 0.061 | 0 |
| 5.868495076905508 | 0.538 | 0.064 | 0 |
| 5.871636669559098 | 0.543 | 0.067 | 0 |
| 5.874778262212687 | 0.548 | 0.07 | 0.001 |
| 5.877919854866277 | 0.554 | 0.074 | 0.001 |
| 5.881061447519866 | 0.559 | 0.077 | 0.001 |
| 5.884203040173456 | 0.564 | 0.081 | 0.001 |
| 5.887344632827046 | 0.569 | 0.085 | 0.001 |
| 5.890486225480635 | 0.575 | 0.088 | 0.001 |
| 5.893627818134224 | 0.58 | 0.092 | 0.001 |
| 5.896769410787814 | 0.585 | 0.096 | 0.002 |
| 5.899911003441404 | 0.59 | 0.101 | 0.002 |
| 5.903052596094994 | 0.595 | 0.105 | 0.002 |
| 5.906194188748583 | 0.601 | 0.109 | 0.003 |
| 5.909335781402172 | 0.606 | 0.114 | 0.003 |
| 5.912477374055762 | 0.611 | 0.119 | 0.003 |
| 5.915618966709352 | 0.616 | 0.124 | 0.004 |
| 5.918760559362942 | 0.622 | 0.129 | 0.004 |
| 5.921902152016531 | 0.627 | 0.134 | 0.005 |
| 5.92504374467012 | 0.632 | 0.139 | 0.006 |
| 5.92818533732371 | 0.637 | 0.144 | 0.006 |
| 5.9313269299773 | 0.642 | 0.15 | 0.007 |
| 5.93446852263089 | 0.648 | 0.155 | 0.008 |
| 5.93761011528448 | 0.653 | 0.161 | 0.009 |
| 5.940751707938068 | 0.658 | 0.167 | 0.01 |
| 5.943893300591658 | 0.663 | 0.173 | 0.011 |
| 5.947034893245248 | 0.668 | 0.179 | 0.012 |
| 5.950176485898837 | 0.673 | 0.186 | 0.014 |
| 5.953318078552427 | 0.678 | 0.192 | 0.015 |
| 5.956459671206017 | 0.684 | 0.199 | 0.017 |
| 5.959601263859606 | 0.689 | 0.206 | 0.018 |
| 5.962742856513196 | 0.694 | 0.213 | 0.02 |
| 5.965884449166785 | 0.699 | 0.22 | 0.022 |
| 5.969026041820375 | 0.704 | 0.227 | 0.024 |
| 5.972167634473964 | 0.709 | 0.234 | 0.027 |
| 5.975309227127554 | 0.714 | 0.242 | 0.029 |
| 5.978450819781144 | 0.719 | 0.249 | 0.032 |
| 5.981592412434733 | 0.724 | 0.257 | 0.034 |
| 5.984734005088323 | 0.729 | 0.265 | 0.037 |
| 5.987875597741913 | 0.734 | 0.273 | 0.041 |
| 5.991017190395502 | 0.739 | 0.281 | 0.044 |
| 5.994158783049092 | 0.743 | 0.289 | 0.047 |
| 5.997300375702681 | 0.748 | 0.297 | 0.051 |
| 6.000441968356271 | 0.753 | 0.306 | 0.055 |
| 6.003583561009861 | 0.758 | 0.314 | 0.06 |
| 6.00672515366345 | 0.763 | 0.323 | 0.064 |
| 6.00986674631704 | 0.767 | 0.332 | 0.069 |
| 6.01300833897063 | 0.772 | 0.341 | 0.074 |
| 6.01614993162422 | 0.777 | 0.35 | 0.079 |
| 6.019291524277808 | 0.781 | 0.359 | 0.085 |
| 6.022433116931398 | 0.786 | 0.368 | 0.09 |
| 6.025574709584988 | 0.791 | 0.378 | 0.096 |
| 6.028716302238577 | 0.795 | 0.387 | 0.103 |
| 6.031857894892167 | 0.8 | 0.397 | 0.109 |
| 6.034999487545757 | 0.804 | 0.406 | 0.116 |
| 6.038141080199346 | 0.809 | 0.416 | 0.124 |
| 6.041282672852935 | 0.813 | 0.426 | 0.131 |
| 6.044424265506525 | 0.818 | 0.436 | 0.139 |
| 6.047565858160115 | 0.822 | 0.446 | 0.147 |
| 6.050707450813704 | 0.826 | 0.456 | 0.155 |
| 6.053849043467294 | 0.831 | 0.466 | 0.164 |
| 6.056990636120884 | 0.835 | 0.476 | 0.173 |
| 6.060132228774473 | 0.839 | 0.486 | 0.183 |
| 6.063273821428063 | 0.843 | 0.497 | 0.192 |
| 6.066415414081653 | 0.847 | 0.507 | 0.202 |
| 6.069557006735242 | 0.851 | 0.517 | 0.213 |
| 6.072698599388831 | 0.855 | 0.528 | 0.223 |
| 6.07584019204242 | 0.859 | 0.538 | 0.234 |
| 6.078981784696011 | 0.863 | 0.548 | 0.245 |
| 6.082123377349601 | 0.867 | 0.559 | 0.257 |
| 6.08526497000319 | 0.871 | 0.569 | 0.269 |
| 6.08840656265678 | 0.875 | 0.58 | 0.281 |
| 6.09154815531037 | 0.879 | 0.59 | 0.293 |
| 6.094689747963959 | 0.882 | 0.601 | 0.306 |
| 6.097831340617549 | 0.886 | 0.611 | 0.319 |
| 6.100972933271138 | 0.89 | 0.622 | 0.332 |
| 6.104114525924728 | 0.893 | 0.632 | 0.345 |
| 6.107256118578317 | 0.897 | 0.642 | 0.359 |
| 6.110397711231907 | 0.9 | 0.653 | 0.373 |
| 6.113539303885497 | 0.904 | 0.663 | 0.387 |
| 6.116680896539086 | 0.907 | 0.673 | 0.402 |
| 6.119822489192675 | 0.91 | 0.684 | 0.416 |
| 6.122964081846265 | 0.914 | 0.694 | 0.431 |
| 6.126105674499855 | 0.917 | 0.704 | 0.446 |
| 6.129247267153445 | 0.92 | 0.714 | 0.461 |
| 6.132388859807034 | 0.923 | 0.724 | 0.476 |
| 6.135530452460624 | 0.926 | 0.734 | 0.491 |
| 6.138672045114213 | 0.929 | 0.743 | 0.507 |
| 6.141813637767803 | 0.932 | 0.753 | 0.522 |
| 6.144955230421393 | 0.935 | 0.763 | 0.538 |
| 6.148096823074982 | 0.938 | 0.772 | 0.554 |
| 6.151238415728571 | 0.941 | 0.781 | 0.569 |
| 6.154380008382161 | 0.943 | 0.791 | 0.585 |
| 6.157521601035751 | 0.946 | 0.8 | 0.601 |
| 6.16066319368934 | 0.949 | 0.809 | 0.616 |
| 6.16380478634293 | 0.951 | 0.818 | 0.632 |
| 6.16694637899652 | 0.954 | 0.826 | 0.648 |
| 6.170087971650109 | 0.956 | 0.835 | 0.663 |
| 6.173229564303698 | 0.958 | 0.843 | 0.678 |
| 6.176371156957289 | 0.961 | 0.851 | 0.694 |
| 6.179512749610878 | 0.963 | 0.859 | 0.709 |
| 6.182654342264468 | 0.965 | 0.867 | 0.724 |
| 6.185795934918057 | 0.967 | 0.875 | 0.739 |
| 6.188937527571647 | 0.969 | 0.882 | 0.753 |
| 6.192079120225237 | 0.971 | 0.89 | 0.767 |
| 6.195220712878826 | 0.973 | 0.897 | 0.781 |
| 6.198362305532415 | 0.975 | 0.904 | 0.795 |
| 6.201503898186005 | 0.977 | 0.91 | 0.809 |
| 6.204645490839594 | 0.979 | 0.917 | 0.822 |
| 6.207787083493184 | 0.98 | 0.923 | 0.835 |
| 6.210928676146774 | 0.982 | 0.929 | 0.847 |
| 6.214070268800364 | 0.983 | 0.935 | 0.859 |
| 6.217211861453953 | 0.985 | 0.941 | 0.871 |
| 6.220353454107543 | 0.986 | 0.946 | 0.882 |
| 6.223495046761133 | 0.988 | 0.951 | 0.893 |
| 6.226636639414722 | 0.989 | 0.956 | 0.904 |
| 6.229778232068312 | 0.99 | 0.961 | 0.914 |
| 6.232919824721901 | 0.991 | 0.965 | 0.923 |
| 6.236061417375491 | 0.992 | 0.969 | 0.932 |
| 6.23920301002908 | 0.993 | 0.973 | 0.941 |
| 6.24234460268267 | 0.994 | 0.977 | 0.949 |
| 6.24548619533626 | 0.995 | 0.98 | 0.956 |
| 6.24862778798985 | 0.996 | 0.983 | 0.963 |
| 6.251769380643438 | 0.997 | 0.986 | 0.969 |
| 6.254910973297028 | 0.997 | 0.989 | 0.975 |
| 6.258052565950618 | 0.998 | 0.991 | 0.98 |
| 6.261194158604208 | 0.998 | 0.993 | 0.985 |
| 6.264335751257797 | 0.999 | 0.995 | 0.989 |
| 6.267477343911387 | 0.999 | 0.997 | 0.992 |
| 6.270618936564976 | 0.999 | 0.998 | 0.995 |
| 6.273760529218566 | 1 | 0.999 | 0.997 |
| 6.276902121872155 | 1 | 0.999 | 0.999 |
| 6.280043714525745 | 1 | 1 | 1 |
| 6.283185307179335 | 1 | 1 | 1 |